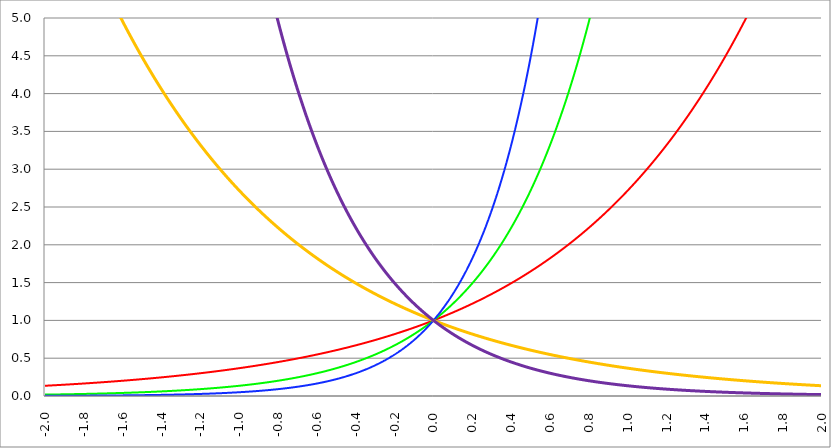
| Category | Series 1 | Series 0 | Series 2 | Series 3 | Series 4 |
|---|---|---|---|---|---|
| -2.0 | 0.135 | 0.018 | 0.002 | 7.389 | 54.598 |
| -1.998 | 0.136 | 0.018 | 0.002 | 7.374 | 54.38 |
| -1.996 | 0.136 | 0.018 | 0.003 | 7.36 | 54.163 |
| -1.994 | 0.136 | 0.019 | 0.003 | 7.345 | 53.947 |
| -1.992 | 0.136 | 0.019 | 0.003 | 7.33 | 53.732 |
| -1.99 | 0.137 | 0.019 | 0.003 | 7.316 | 53.517 |
| -1.988 | 0.137 | 0.019 | 0.003 | 7.301 | 53.303 |
| -1.986 | 0.137 | 0.019 | 0.003 | 7.286 | 53.091 |
| -1.984 | 0.138 | 0.019 | 0.003 | 7.272 | 52.879 |
| -1.982 | 0.138 | 0.019 | 0.003 | 7.257 | 52.668 |
| -1.98 | 0.138 | 0.019 | 0.003 | 7.243 | 52.457 |
| -1.978 | 0.138 | 0.019 | 0.003 | 7.228 | 52.248 |
| -1.976 | 0.139 | 0.019 | 0.003 | 7.214 | 52.039 |
| -1.974 | 0.139 | 0.019 | 0.003 | 7.199 | 51.832 |
| -1.972 | 0.139 | 0.019 | 0.003 | 7.185 | 51.625 |
| -1.97 | 0.139 | 0.019 | 0.003 | 7.171 | 51.419 |
| -1.968 | 0.14 | 0.02 | 0.003 | 7.156 | 51.213 |
| -1.966 | 0.14 | 0.02 | 0.003 | 7.142 | 51.009 |
| -1.964 | 0.14 | 0.02 | 0.003 | 7.128 | 50.805 |
| -1.962 | 0.141 | 0.02 | 0.003 | 7.114 | 50.602 |
| -1.96 | 0.141 | 0.02 | 0.003 | 7.099 | 50.4 |
| -1.958 | 0.141 | 0.02 | 0.003 | 7.085 | 50.199 |
| -1.956 | 0.141 | 0.02 | 0.003 | 7.071 | 49.999 |
| -1.954 | 0.142 | 0.02 | 0.003 | 7.057 | 49.799 |
| -1.952 | 0.142 | 0.02 | 0.003 | 7.043 | 49.6 |
| -1.95 | 0.142 | 0.02 | 0.003 | 7.029 | 49.402 |
| -1.948 | 0.143 | 0.02 | 0.003 | 7.015 | 49.205 |
| -1.946 | 0.143 | 0.02 | 0.003 | 7.001 | 49.009 |
| -1.944 | 0.143 | 0.02 | 0.003 | 6.987 | 48.813 |
| -1.942 | 0.143 | 0.021 | 0.003 | 6.973 | 48.618 |
| -1.94 | 0.144 | 0.021 | 0.003 | 6.959 | 48.424 |
| -1.938 | 0.144 | 0.021 | 0.003 | 6.945 | 48.231 |
| -1.936 | 0.144 | 0.021 | 0.003 | 6.931 | 48.038 |
| -1.934 | 0.145 | 0.021 | 0.003 | 6.917 | 47.847 |
| -1.932 | 0.145 | 0.021 | 0.003 | 6.903 | 47.656 |
| -1.93 | 0.145 | 0.021 | 0.003 | 6.89 | 47.465 |
| -1.928 | 0.145 | 0.021 | 0.003 | 6.876 | 47.276 |
| -1.926 | 0.146 | 0.021 | 0.003 | 6.862 | 47.087 |
| -1.924 | 0.146 | 0.021 | 0.003 | 6.848 | 46.899 |
| -1.922 | 0.146 | 0.021 | 0.003 | 6.835 | 46.712 |
| -1.92 | 0.147 | 0.021 | 0.003 | 6.821 | 46.525 |
| -1.918 | 0.147 | 0.022 | 0.003 | 6.807 | 46.34 |
| -1.916 | 0.147 | 0.022 | 0.003 | 6.794 | 46.155 |
| -1.914 | 0.147 | 0.022 | 0.003 | 6.78 | 45.971 |
| -1.912 | 0.148 | 0.022 | 0.003 | 6.767 | 45.787 |
| -1.91 | 0.148 | 0.022 | 0.003 | 6.753 | 45.604 |
| -1.908 | 0.148 | 0.022 | 0.003 | 6.74 | 45.422 |
| -1.906 | 0.149 | 0.022 | 0.003 | 6.726 | 45.241 |
| -1.904 | 0.149 | 0.022 | 0.003 | 6.713 | 45.06 |
| -1.902 | 0.149 | 0.022 | 0.003 | 6.699 | 44.88 |
| -1.9 | 0.15 | 0.022 | 0.003 | 6.686 | 44.701 |
| -1.898 | 0.15 | 0.022 | 0.003 | 6.673 | 44.523 |
| -1.896 | 0.15 | 0.023 | 0.003 | 6.659 | 44.345 |
| -1.894 | 0.15 | 0.023 | 0.003 | 6.646 | 44.168 |
| -1.892 | 0.151 | 0.023 | 0.003 | 6.633 | 43.992 |
| -1.89 | 0.151 | 0.023 | 0.003 | 6.619 | 43.816 |
| -1.888 | 0.151 | 0.023 | 0.003 | 6.606 | 43.641 |
| -1.886 | 0.152 | 0.023 | 0.003 | 6.593 | 43.467 |
| -1.884 | 0.152 | 0.023 | 0.004 | 6.58 | 43.293 |
| -1.882 | 0.152 | 0.023 | 0.004 | 6.567 | 43.121 |
| -1.88 | 0.153 | 0.023 | 0.004 | 6.554 | 42.948 |
| -1.878 | 0.153 | 0.023 | 0.004 | 6.54 | 42.777 |
| -1.876 | 0.153 | 0.023 | 0.004 | 6.527 | 42.606 |
| -1.874 | 0.154 | 0.024 | 0.004 | 6.514 | 42.436 |
| -1.872 | 0.154 | 0.024 | 0.004 | 6.501 | 42.267 |
| -1.87 | 0.154 | 0.024 | 0.004 | 6.488 | 42.098 |
| -1.868 | 0.154 | 0.024 | 0.004 | 6.475 | 41.93 |
| -1.866 | 0.155 | 0.024 | 0.004 | 6.462 | 41.763 |
| -1.864 | 0.155 | 0.024 | 0.004 | 6.449 | 41.596 |
| -1.862 | 0.155 | 0.024 | 0.004 | 6.437 | 41.43 |
| -1.86 | 0.156 | 0.024 | 0.004 | 6.424 | 41.264 |
| -1.858 | 0.156 | 0.024 | 0.004 | 6.411 | 41.1 |
| -1.856 | 0.156 | 0.024 | 0.004 | 6.398 | 40.936 |
| -1.854 | 0.157 | 0.025 | 0.004 | 6.385 | 40.772 |
| -1.852 | 0.157 | 0.025 | 0.004 | 6.373 | 40.609 |
| -1.85 | 0.157 | 0.025 | 0.004 | 6.36 | 40.447 |
| -1.848 | 0.158 | 0.025 | 0.004 | 6.347 | 40.286 |
| -1.846 | 0.158 | 0.025 | 0.004 | 6.334 | 40.125 |
| -1.844 | 0.158 | 0.025 | 0.004 | 6.322 | 39.965 |
| -1.842 | 0.159 | 0.025 | 0.004 | 6.309 | 39.805 |
| -1.84 | 0.159 | 0.025 | 0.004 | 6.297 | 39.646 |
| -1.838 | 0.159 | 0.025 | 0.004 | 6.284 | 39.488 |
| -1.836 | 0.159 | 0.025 | 0.004 | 6.271 | 39.33 |
| -1.834 | 0.16 | 0.026 | 0.004 | 6.259 | 39.173 |
| -1.832 | 0.16 | 0.026 | 0.004 | 6.246 | 39.017 |
| -1.83 | 0.16 | 0.026 | 0.004 | 6.234 | 38.861 |
| -1.828 | 0.161 | 0.026 | 0.004 | 6.221 | 38.706 |
| -1.826 | 0.161 | 0.026 | 0.004 | 6.209 | 38.552 |
| -1.824 | 0.161 | 0.026 | 0.004 | 6.197 | 38.398 |
| -1.822 | 0.162 | 0.026 | 0.004 | 6.184 | 38.245 |
| -1.82 | 0.162 | 0.026 | 0.004 | 6.172 | 38.092 |
| -1.818 | 0.162 | 0.026 | 0.004 | 6.16 | 37.94 |
| -1.816 | 0.163 | 0.026 | 0.004 | 6.147 | 37.788 |
| -1.814 | 0.163 | 0.027 | 0.004 | 6.135 | 37.637 |
| -1.812 | 0.163 | 0.027 | 0.004 | 6.123 | 37.487 |
| -1.81 | 0.164 | 0.027 | 0.004 | 6.11 | 37.338 |
| -1.808 | 0.164 | 0.027 | 0.004 | 6.098 | 37.189 |
| -1.806 | 0.164 | 0.027 | 0.004 | 6.086 | 37.04 |
| -1.804 | 0.165 | 0.027 | 0.004 | 6.074 | 36.892 |
| -1.802 | 0.165 | 0.027 | 0.004 | 6.062 | 36.745 |
| -1.8 | 0.165 | 0.027 | 0.005 | 6.05 | 36.598 |
| -1.798 | 0.166 | 0.027 | 0.005 | 6.038 | 36.452 |
| -1.796 | 0.166 | 0.028 | 0.005 | 6.025 | 36.307 |
| -1.794 | 0.166 | 0.028 | 0.005 | 6.013 | 36.162 |
| -1.792 | 0.167 | 0.028 | 0.005 | 6.001 | 36.017 |
| -1.79 | 0.167 | 0.028 | 0.005 | 5.989 | 35.874 |
| -1.788 | 0.167 | 0.028 | 0.005 | 5.977 | 35.73 |
| -1.786 | 0.168 | 0.028 | 0.005 | 5.966 | 35.588 |
| -1.784 | 0.168 | 0.028 | 0.005 | 5.954 | 35.446 |
| -1.782 | 0.168 | 0.028 | 0.005 | 5.942 | 35.304 |
| -1.78 | 0.169 | 0.028 | 0.005 | 5.93 | 35.163 |
| -1.778 | 0.169 | 0.029 | 0.005 | 5.918 | 35.023 |
| -1.776 | 0.169 | 0.029 | 0.005 | 5.906 | 34.883 |
| -1.774 | 0.17 | 0.029 | 0.005 | 5.894 | 34.744 |
| -1.772 | 0.17 | 0.029 | 0.005 | 5.883 | 34.605 |
| -1.77 | 0.17 | 0.029 | 0.005 | 5.871 | 34.467 |
| -1.768 | 0.171 | 0.029 | 0.005 | 5.859 | 34.329 |
| -1.766 | 0.171 | 0.029 | 0.005 | 5.847 | 34.192 |
| -1.764 | 0.171 | 0.029 | 0.005 | 5.836 | 34.056 |
| -1.762 | 0.172 | 0.029 | 0.005 | 5.824 | 33.92 |
| -1.76 | 0.172 | 0.03 | 0.005 | 5.812 | 33.784 |
| -1.758 | 0.172 | 0.03 | 0.005 | 5.801 | 33.65 |
| -1.756 | 0.173 | 0.03 | 0.005 | 5.789 | 33.515 |
| -1.754 | 0.173 | 0.03 | 0.005 | 5.778 | 33.381 |
| -1.752 | 0.173 | 0.03 | 0.005 | 5.766 | 33.248 |
| -1.75 | 0.174 | 0.03 | 0.005 | 5.755 | 33.115 |
| -1.748 | 0.174 | 0.03 | 0.005 | 5.743 | 32.983 |
| -1.746 | 0.174 | 0.03 | 0.005 | 5.732 | 32.852 |
| -1.744 | 0.175 | 0.031 | 0.005 | 5.72 | 32.72 |
| -1.742 | 0.175 | 0.031 | 0.005 | 5.709 | 32.59 |
| -1.74 | 0.176 | 0.031 | 0.005 | 5.697 | 32.46 |
| -1.738 | 0.176 | 0.031 | 0.005 | 5.686 | 32.33 |
| -1.736 | 0.176 | 0.031 | 0.005 | 5.675 | 32.201 |
| -1.734 | 0.177 | 0.031 | 0.006 | 5.663 | 32.073 |
| -1.732 | 0.177 | 0.031 | 0.006 | 5.652 | 31.944 |
| -1.73 | 0.177 | 0.031 | 0.006 | 5.641 | 31.817 |
| -1.728 | 0.178 | 0.032 | 0.006 | 5.629 | 31.69 |
| -1.726 | 0.178 | 0.032 | 0.006 | 5.618 | 31.563 |
| -1.724 | 0.178 | 0.032 | 0.006 | 5.607 | 31.437 |
| -1.722 | 0.179 | 0.032 | 0.006 | 5.596 | 31.312 |
| -1.72 | 0.179 | 0.032 | 0.006 | 5.585 | 31.187 |
| -1.718 | 0.179 | 0.032 | 0.006 | 5.573 | 31.062 |
| -1.716 | 0.18 | 0.032 | 0.006 | 5.562 | 30.938 |
| -1.714 | 0.18 | 0.032 | 0.006 | 5.551 | 30.815 |
| -1.712 | 0.181 | 0.033 | 0.006 | 5.54 | 30.692 |
| -1.71 | 0.181 | 0.033 | 0.006 | 5.529 | 30.569 |
| -1.708 | 0.181 | 0.033 | 0.006 | 5.518 | 30.447 |
| -1.706 | 0.182 | 0.033 | 0.006 | 5.507 | 30.326 |
| -1.704 | 0.182 | 0.033 | 0.006 | 5.496 | 30.205 |
| -1.702 | 0.182 | 0.033 | 0.006 | 5.485 | 30.084 |
| -1.7 | 0.183 | 0.033 | 0.006 | 5.474 | 29.964 |
| -1.698 | 0.183 | 0.034 | 0.006 | 5.463 | 29.844 |
| -1.696 | 0.183 | 0.034 | 0.006 | 5.452 | 29.725 |
| -1.694 | 0.184 | 0.034 | 0.006 | 5.441 | 29.607 |
| -1.692 | 0.184 | 0.034 | 0.006 | 5.43 | 29.488 |
| -1.69 | 0.185 | 0.034 | 0.006 | 5.419 | 29.371 |
| -1.688 | 0.185 | 0.034 | 0.006 | 5.409 | 29.254 |
| -1.686 | 0.185 | 0.034 | 0.006 | 5.398 | 29.137 |
| -1.684 | 0.186 | 0.034 | 0.006 | 5.387 | 29.02 |
| -1.682 | 0.186 | 0.035 | 0.006 | 5.376 | 28.905 |
| -1.68 | 0.186 | 0.035 | 0.006 | 5.366 | 28.789 |
| -1.678 | 0.187 | 0.035 | 0.007 | 5.355 | 28.674 |
| -1.676 | 0.187 | 0.035 | 0.007 | 5.344 | 28.56 |
| -1.674 | 0.187 | 0.035 | 0.007 | 5.333 | 28.446 |
| -1.672 | 0.188 | 0.035 | 0.007 | 5.323 | 28.332 |
| -1.67 | 0.188 | 0.035 | 0.007 | 5.312 | 28.219 |
| -1.668 | 0.189 | 0.036 | 0.007 | 5.302 | 28.106 |
| -1.666 | 0.189 | 0.036 | 0.007 | 5.291 | 27.994 |
| -1.664 | 0.189 | 0.036 | 0.007 | 5.28 | 27.883 |
| -1.662 | 0.19 | 0.036 | 0.007 | 5.27 | 27.771 |
| -1.66 | 0.19 | 0.036 | 0.007 | 5.259 | 27.66 |
| -1.658 | 0.191 | 0.036 | 0.007 | 5.249 | 27.55 |
| -1.656 | 0.191 | 0.036 | 0.007 | 5.238 | 27.44 |
| -1.654 | 0.191 | 0.037 | 0.007 | 5.228 | 27.33 |
| -1.652 | 0.192 | 0.037 | 0.007 | 5.217 | 27.221 |
| -1.65 | 0.192 | 0.037 | 0.007 | 5.207 | 27.113 |
| -1.648 | 0.192 | 0.037 | 0.007 | 5.197 | 27.004 |
| -1.646 | 0.193 | 0.037 | 0.007 | 5.186 | 26.897 |
| -1.644 | 0.193 | 0.037 | 0.007 | 5.176 | 26.789 |
| -1.642 | 0.194 | 0.037 | 0.007 | 5.165 | 26.682 |
| -1.64 | 0.194 | 0.038 | 0.007 | 5.155 | 26.576 |
| -1.638 | 0.194 | 0.038 | 0.007 | 5.145 | 26.47 |
| -1.636 | 0.195 | 0.038 | 0.007 | 5.135 | 26.364 |
| -1.634 | 0.195 | 0.038 | 0.007 | 5.124 | 26.259 |
| -1.632 | 0.196 | 0.038 | 0.007 | 5.114 | 26.154 |
| -1.63 | 0.196 | 0.038 | 0.008 | 5.104 | 26.05 |
| -1.628 | 0.196 | 0.039 | 0.008 | 5.094 | 25.946 |
| -1.626 | 0.197 | 0.039 | 0.008 | 5.083 | 25.842 |
| -1.624 | 0.197 | 0.039 | 0.008 | 5.073 | 25.739 |
| -1.622 | 0.198 | 0.039 | 0.008 | 5.063 | 25.636 |
| -1.62 | 0.198 | 0.039 | 0.008 | 5.053 | 25.534 |
| -1.618 | 0.198 | 0.039 | 0.008 | 5.043 | 25.432 |
| -1.616 | 0.199 | 0.039 | 0.008 | 5.033 | 25.33 |
| -1.614 | 0.199 | 0.04 | 0.008 | 5.023 | 25.229 |
| -1.612 | 0.199 | 0.04 | 0.008 | 5.013 | 25.128 |
| -1.61 | 0.2 | 0.04 | 0.008 | 5.003 | 25.028 |
| -1.608 | 0.2 | 0.04 | 0.008 | 4.993 | 24.928 |
| -1.606 | 0.201 | 0.04 | 0.008 | 4.983 | 24.829 |
| -1.604 | 0.201 | 0.04 | 0.008 | 4.973 | 24.73 |
| -1.602 | 0.201 | 0.041 | 0.008 | 4.963 | 24.631 |
| -1.6 | 0.202 | 0.041 | 0.008 | 4.953 | 24.533 |
| -1.598 | 0.202 | 0.041 | 0.008 | 4.943 | 24.435 |
| -1.596 | 0.203 | 0.041 | 0.008 | 4.933 | 24.337 |
| -1.594 | 0.203 | 0.041 | 0.008 | 4.923 | 24.24 |
| -1.592 | 0.204 | 0.041 | 0.008 | 4.914 | 24.143 |
| -1.59 | 0.204 | 0.042 | 0.008 | 4.904 | 24.047 |
| -1.588 | 0.204 | 0.042 | 0.009 | 4.894 | 23.951 |
| -1.586 | 0.205 | 0.042 | 0.009 | 4.884 | 23.855 |
| -1.584 | 0.205 | 0.042 | 0.009 | 4.874 | 23.76 |
| -1.582 | 0.206 | 0.042 | 0.009 | 4.865 | 23.665 |
| -1.58 | 0.206 | 0.042 | 0.009 | 4.855 | 23.571 |
| -1.578 | 0.206 | 0.043 | 0.009 | 4.845 | 23.477 |
| -1.576 | 0.207 | 0.043 | 0.009 | 4.836 | 23.383 |
| -1.574 | 0.207 | 0.043 | 0.009 | 4.826 | 23.289 |
| -1.572 | 0.208 | 0.043 | 0.009 | 4.816 | 23.196 |
| -1.57 | 0.208 | 0.043 | 0.009 | 4.807 | 23.104 |
| -1.568 | 0.208 | 0.043 | 0.009 | 4.797 | 23.012 |
| -1.566 | 0.209 | 0.044 | 0.009 | 4.787 | 22.92 |
| -1.564 | 0.209 | 0.044 | 0.009 | 4.778 | 22.828 |
| -1.562 | 0.21 | 0.044 | 0.009 | 4.768 | 22.737 |
| -1.56 | 0.21 | 0.044 | 0.009 | 4.759 | 22.646 |
| -1.558 | 0.211 | 0.044 | 0.009 | 4.749 | 22.556 |
| -1.556 | 0.211 | 0.045 | 0.009 | 4.74 | 22.466 |
| -1.554 | 0.211 | 0.045 | 0.009 | 4.73 | 22.376 |
| -1.552 | 0.212 | 0.045 | 0.01 | 4.721 | 22.287 |
| -1.55 | 0.212 | 0.045 | 0.01 | 4.711 | 22.198 |
| -1.548 | 0.213 | 0.045 | 0.01 | 4.702 | 22.109 |
| -1.546 | 0.213 | 0.045 | 0.01 | 4.693 | 22.021 |
| -1.544 | 0.214 | 0.046 | 0.01 | 4.683 | 21.933 |
| -1.542 | 0.214 | 0.046 | 0.01 | 4.674 | 21.846 |
| -1.54 | 0.214 | 0.046 | 0.01 | 4.665 | 21.758 |
| -1.538 | 0.215 | 0.046 | 0.01 | 4.655 | 21.672 |
| -1.536 | 0.215 | 0.046 | 0.01 | 4.646 | 21.585 |
| -1.534 | 0.216 | 0.047 | 0.01 | 4.637 | 21.499 |
| -1.532 | 0.216 | 0.047 | 0.01 | 4.627 | 21.413 |
| -1.53 | 0.217 | 0.047 | 0.01 | 4.618 | 21.328 |
| -1.528 | 0.217 | 0.047 | 0.01 | 4.609 | 21.242 |
| -1.526 | 0.217 | 0.047 | 0.01 | 4.6 | 21.158 |
| -1.524 | 0.218 | 0.047 | 0.01 | 4.591 | 21.073 |
| -1.522 | 0.218 | 0.048 | 0.01 | 4.581 | 20.989 |
| -1.52 | 0.219 | 0.048 | 0.01 | 4.572 | 20.905 |
| -1.518 | 0.219 | 0.048 | 0.011 | 4.563 | 20.822 |
| -1.516 | 0.22 | 0.048 | 0.011 | 4.554 | 20.739 |
| -1.514 | 0.22 | 0.048 | 0.011 | 4.545 | 20.656 |
| -1.512 | 0.22 | 0.049 | 0.011 | 4.536 | 20.573 |
| -1.51 | 0.221 | 0.049 | 0.011 | 4.527 | 20.491 |
| -1.508 | 0.221 | 0.049 | 0.011 | 4.518 | 20.409 |
| -1.506 | 0.222 | 0.049 | 0.011 | 4.509 | 20.328 |
| -1.504 | 0.222 | 0.049 | 0.011 | 4.5 | 20.247 |
| -1.502 | 0.223 | 0.05 | 0.011 | 4.491 | 20.166 |
| -1.5 | 0.223 | 0.05 | 0.011 | 4.482 | 20.086 |
| -1.498 | 0.224 | 0.05 | 0.011 | 4.473 | 20.005 |
| -1.496 | 0.224 | 0.05 | 0.011 | 4.464 | 19.925 |
| -1.494 | 0.224 | 0.05 | 0.011 | 4.455 | 19.846 |
| -1.492 | 0.225 | 0.051 | 0.011 | 4.446 | 19.767 |
| -1.49 | 0.225 | 0.051 | 0.011 | 4.437 | 19.688 |
| -1.488 | 0.226 | 0.051 | 0.012 | 4.428 | 19.609 |
| -1.486 | 0.226 | 0.051 | 0.012 | 4.419 | 19.531 |
| -1.484 | 0.227 | 0.051 | 0.012 | 4.411 | 19.453 |
| -1.482 | 0.227 | 0.052 | 0.012 | 4.402 | 19.375 |
| -1.48 | 0.228 | 0.052 | 0.012 | 4.393 | 19.298 |
| -1.478 | 0.228 | 0.052 | 0.012 | 4.384 | 19.221 |
| -1.476 | 0.229 | 0.052 | 0.012 | 4.375 | 19.144 |
| -1.474 | 0.229 | 0.052 | 0.012 | 4.367 | 19.068 |
| -1.472 | 0.229 | 0.053 | 0.012 | 4.358 | 18.992 |
| -1.469999999999999 | 0.23 | 0.053 | 0.012 | 4.349 | 18.916 |
| -1.467999999999999 | 0.23 | 0.053 | 0.012 | 4.341 | 18.84 |
| -1.465999999999999 | 0.231 | 0.053 | 0.012 | 4.332 | 18.765 |
| -1.463999999999999 | 0.231 | 0.054 | 0.012 | 4.323 | 18.69 |
| -1.461999999999999 | 0.232 | 0.054 | 0.012 | 4.315 | 18.616 |
| -1.459999999999999 | 0.232 | 0.054 | 0.013 | 4.306 | 18.541 |
| -1.457999999999999 | 0.233 | 0.054 | 0.013 | 4.297 | 18.467 |
| -1.455999999999999 | 0.233 | 0.054 | 0.013 | 4.289 | 18.394 |
| -1.453999999999999 | 0.234 | 0.055 | 0.013 | 4.28 | 18.32 |
| -1.451999999999999 | 0.234 | 0.055 | 0.013 | 4.272 | 18.247 |
| -1.449999999999999 | 0.235 | 0.055 | 0.013 | 4.263 | 18.174 |
| -1.447999999999999 | 0.235 | 0.055 | 0.013 | 4.255 | 18.102 |
| -1.445999999999999 | 0.236 | 0.055 | 0.013 | 4.246 | 18.029 |
| -1.443999999999999 | 0.236 | 0.056 | 0.013 | 4.238 | 17.957 |
| -1.441999999999999 | 0.236 | 0.056 | 0.013 | 4.229 | 17.886 |
| -1.439999999999999 | 0.237 | 0.056 | 0.013 | 4.221 | 17.814 |
| -1.437999999999999 | 0.237 | 0.056 | 0.013 | 4.212 | 17.743 |
| -1.435999999999999 | 0.238 | 0.057 | 0.013 | 4.204 | 17.672 |
| -1.433999999999999 | 0.238 | 0.057 | 0.014 | 4.195 | 17.602 |
| -1.431999999999999 | 0.239 | 0.057 | 0.014 | 4.187 | 17.532 |
| -1.429999999999999 | 0.239 | 0.057 | 0.014 | 4.179 | 17.462 |
| -1.427999999999999 | 0.24 | 0.057 | 0.014 | 4.17 | 17.392 |
| -1.425999999999999 | 0.24 | 0.058 | 0.014 | 4.162 | 17.322 |
| -1.423999999999999 | 0.241 | 0.058 | 0.014 | 4.154 | 17.253 |
| -1.421999999999999 | 0.241 | 0.058 | 0.014 | 4.145 | 17.184 |
| -1.419999999999999 | 0.242 | 0.058 | 0.014 | 4.137 | 17.116 |
| -1.417999999999999 | 0.242 | 0.059 | 0.014 | 4.129 | 17.047 |
| -1.415999999999999 | 0.243 | 0.059 | 0.014 | 4.121 | 16.979 |
| -1.413999999999999 | 0.243 | 0.059 | 0.014 | 4.112 | 16.912 |
| -1.411999999999999 | 0.244 | 0.059 | 0.014 | 4.104 | 16.844 |
| -1.409999999999999 | 0.244 | 0.06 | 0.015 | 4.096 | 16.777 |
| -1.407999999999999 | 0.245 | 0.06 | 0.015 | 4.088 | 16.71 |
| -1.405999999999999 | 0.245 | 0.06 | 0.015 | 4.08 | 16.643 |
| -1.403999999999999 | 0.246 | 0.06 | 0.015 | 4.071 | 16.577 |
| -1.401999999999999 | 0.246 | 0.061 | 0.015 | 4.063 | 16.511 |
| -1.399999999999999 | 0.247 | 0.061 | 0.015 | 4.055 | 16.445 |
| -1.397999999999999 | 0.247 | 0.061 | 0.015 | 4.047 | 16.379 |
| -1.395999999999999 | 0.248 | 0.061 | 0.015 | 4.039 | 16.314 |
| -1.393999999999999 | 0.248 | 0.062 | 0.015 | 4.031 | 16.248 |
| -1.391999999999999 | 0.249 | 0.062 | 0.015 | 4.023 | 16.184 |
| -1.389999999999999 | 0.249 | 0.062 | 0.015 | 4.015 | 16.119 |
| -1.387999999999999 | 0.25 | 0.062 | 0.016 | 4.007 | 16.055 |
| -1.385999999999999 | 0.25 | 0.063 | 0.016 | 3.999 | 15.991 |
| -1.383999999999999 | 0.251 | 0.063 | 0.016 | 3.991 | 15.927 |
| -1.381999999999999 | 0.251 | 0.063 | 0.016 | 3.983 | 15.863 |
| -1.379999999999999 | 0.252 | 0.063 | 0.016 | 3.975 | 15.8 |
| -1.377999999999999 | 0.252 | 0.064 | 0.016 | 3.967 | 15.737 |
| -1.375999999999999 | 0.253 | 0.064 | 0.016 | 3.959 | 15.674 |
| -1.373999999999999 | 0.253 | 0.064 | 0.016 | 3.951 | 15.611 |
| -1.371999999999999 | 0.254 | 0.064 | 0.016 | 3.943 | 15.549 |
| -1.369999999999999 | 0.254 | 0.065 | 0.016 | 3.935 | 15.487 |
| -1.367999999999999 | 0.255 | 0.065 | 0.017 | 3.927 | 15.425 |
| -1.365999999999999 | 0.255 | 0.065 | 0.017 | 3.92 | 15.364 |
| -1.363999999999999 | 0.256 | 0.065 | 0.017 | 3.912 | 15.302 |
| -1.361999999999999 | 0.256 | 0.066 | 0.017 | 3.904 | 15.241 |
| -1.359999999999999 | 0.257 | 0.066 | 0.017 | 3.896 | 15.18 |
| -1.357999999999999 | 0.257 | 0.066 | 0.017 | 3.888 | 15.12 |
| -1.355999999999999 | 0.258 | 0.066 | 0.017 | 3.881 | 15.059 |
| -1.353999999999999 | 0.258 | 0.067 | 0.017 | 3.873 | 14.999 |
| -1.351999999999999 | 0.259 | 0.067 | 0.017 | 3.865 | 14.939 |
| -1.349999999999999 | 0.259 | 0.067 | 0.017 | 3.857 | 14.88 |
| -1.347999999999999 | 0.26 | 0.067 | 0.018 | 3.85 | 14.82 |
| -1.345999999999999 | 0.26 | 0.068 | 0.018 | 3.842 | 14.761 |
| -1.343999999999999 | 0.261 | 0.068 | 0.018 | 3.834 | 14.702 |
| -1.341999999999999 | 0.261 | 0.068 | 0.018 | 3.827 | 14.644 |
| -1.339999999999999 | 0.262 | 0.069 | 0.018 | 3.819 | 14.585 |
| -1.337999999999999 | 0.262 | 0.069 | 0.018 | 3.811 | 14.527 |
| -1.335999999999999 | 0.263 | 0.069 | 0.018 | 3.804 | 14.469 |
| -1.333999999999999 | 0.263 | 0.069 | 0.018 | 3.796 | 14.411 |
| -1.331999999999999 | 0.264 | 0.07 | 0.018 | 3.789 | 14.354 |
| -1.329999999999999 | 0.264 | 0.07 | 0.018 | 3.781 | 14.296 |
| -1.327999999999999 | 0.265 | 0.07 | 0.019 | 3.773 | 14.239 |
| -1.325999999999999 | 0.266 | 0.071 | 0.019 | 3.766 | 14.182 |
| -1.323999999999999 | 0.266 | 0.071 | 0.019 | 3.758 | 14.126 |
| -1.321999999999999 | 0.267 | 0.071 | 0.019 | 3.751 | 14.069 |
| -1.319999999999999 | 0.267 | 0.071 | 0.019 | 3.743 | 14.013 |
| -1.317999999999999 | 0.268 | 0.072 | 0.019 | 3.736 | 13.957 |
| -1.315999999999999 | 0.268 | 0.072 | 0.019 | 3.728 | 13.902 |
| -1.313999999999999 | 0.269 | 0.072 | 0.019 | 3.721 | 13.846 |
| -1.311999999999999 | 0.269 | 0.073 | 0.02 | 3.714 | 13.791 |
| -1.309999999999999 | 0.27 | 0.073 | 0.02 | 3.706 | 13.736 |
| -1.307999999999999 | 0.27 | 0.073 | 0.02 | 3.699 | 13.681 |
| -1.305999999999999 | 0.271 | 0.073 | 0.02 | 3.691 | 13.626 |
| -1.303999999999999 | 0.271 | 0.074 | 0.02 | 3.684 | 13.572 |
| -1.301999999999999 | 0.272 | 0.074 | 0.02 | 3.677 | 13.518 |
| -1.299999999999999 | 0.273 | 0.074 | 0.02 | 3.669 | 13.464 |
| -1.297999999999999 | 0.273 | 0.075 | 0.02 | 3.662 | 13.41 |
| -1.295999999999999 | 0.274 | 0.075 | 0.02 | 3.655 | 13.356 |
| -1.293999999999999 | 0.274 | 0.075 | 0.021 | 3.647 | 13.303 |
| -1.291999999999999 | 0.275 | 0.075 | 0.021 | 3.64 | 13.25 |
| -1.289999999999999 | 0.275 | 0.076 | 0.021 | 3.633 | 13.197 |
| -1.287999999999999 | 0.276 | 0.076 | 0.021 | 3.626 | 13.144 |
| -1.285999999999999 | 0.276 | 0.076 | 0.021 | 3.618 | 13.092 |
| -1.283999999999999 | 0.277 | 0.077 | 0.021 | 3.611 | 13.04 |
| -1.281999999999999 | 0.277 | 0.077 | 0.021 | 3.604 | 12.988 |
| -1.279999999999999 | 0.278 | 0.077 | 0.021 | 3.597 | 12.936 |
| -1.277999999999999 | 0.279 | 0.078 | 0.022 | 3.589 | 12.884 |
| -1.275999999999999 | 0.279 | 0.078 | 0.022 | 3.582 | 12.833 |
| -1.273999999999999 | 0.28 | 0.078 | 0.022 | 3.575 | 12.782 |
| -1.271999999999999 | 0.28 | 0.079 | 0.022 | 3.568 | 12.73 |
| -1.269999999999999 | 0.281 | 0.079 | 0.022 | 3.561 | 12.68 |
| -1.267999999999999 | 0.281 | 0.079 | 0.022 | 3.554 | 12.629 |
| -1.265999999999999 | 0.282 | 0.079 | 0.022 | 3.547 | 12.579 |
| -1.263999999999999 | 0.283 | 0.08 | 0.023 | 3.54 | 12.528 |
| -1.261999999999999 | 0.283 | 0.08 | 0.023 | 3.532 | 12.478 |
| -1.259999999999999 | 0.284 | 0.08 | 0.023 | 3.525 | 12.429 |
| -1.257999999999999 | 0.284 | 0.081 | 0.023 | 3.518 | 12.379 |
| -1.255999999999999 | 0.285 | 0.081 | 0.023 | 3.511 | 12.33 |
| -1.253999999999999 | 0.285 | 0.081 | 0.023 | 3.504 | 12.28 |
| -1.251999999999999 | 0.286 | 0.082 | 0.023 | 3.497 | 12.231 |
| -1.249999999999999 | 0.287 | 0.082 | 0.024 | 3.49 | 12.182 |
| -1.247999999999999 | 0.287 | 0.082 | 0.024 | 3.483 | 12.134 |
| -1.245999999999999 | 0.288 | 0.083 | 0.024 | 3.476 | 12.085 |
| -1.243999999999999 | 0.288 | 0.083 | 0.024 | 3.469 | 12.037 |
| -1.241999999999999 | 0.289 | 0.083 | 0.024 | 3.463 | 11.989 |
| -1.239999999999999 | 0.289 | 0.084 | 0.024 | 3.456 | 11.941 |
| -1.237999999999999 | 0.29 | 0.084 | 0.024 | 3.449 | 11.894 |
| -1.235999999999999 | 0.291 | 0.084 | 0.025 | 3.442 | 11.846 |
| -1.233999999999999 | 0.291 | 0.085 | 0.025 | 3.435 | 11.799 |
| -1.231999999999999 | 0.292 | 0.085 | 0.025 | 3.428 | 11.752 |
| -1.229999999999999 | 0.292 | 0.085 | 0.025 | 3.421 | 11.705 |
| -1.227999999999999 | 0.293 | 0.086 | 0.025 | 3.414 | 11.658 |
| -1.225999999999999 | 0.293 | 0.086 | 0.025 | 3.408 | 11.612 |
| -1.223999999999999 | 0.294 | 0.086 | 0.025 | 3.401 | 11.565 |
| -1.221999999999999 | 0.295 | 0.087 | 0.026 | 3.394 | 11.519 |
| -1.219999999999999 | 0.295 | 0.087 | 0.026 | 3.387 | 11.473 |
| -1.217999999999999 | 0.296 | 0.088 | 0.026 | 3.38 | 11.427 |
| -1.215999999999999 | 0.296 | 0.088 | 0.026 | 3.374 | 11.382 |
| -1.213999999999999 | 0.297 | 0.088 | 0.026 | 3.367 | 11.336 |
| -1.211999999999999 | 0.298 | 0.089 | 0.026 | 3.36 | 11.291 |
| -1.209999999999999 | 0.298 | 0.089 | 0.027 | 3.353 | 11.246 |
| -1.207999999999999 | 0.299 | 0.089 | 0.027 | 3.347 | 11.201 |
| -1.205999999999999 | 0.299 | 0.09 | 0.027 | 3.34 | 11.156 |
| -1.203999999999999 | 0.3 | 0.09 | 0.027 | 3.333 | 11.112 |
| -1.201999999999999 | 0.301 | 0.09 | 0.027 | 3.327 | 11.067 |
| -1.199999999999999 | 0.301 | 0.091 | 0.027 | 3.32 | 11.023 |
| -1.197999999999999 | 0.302 | 0.091 | 0.027 | 3.313 | 10.979 |
| -1.195999999999999 | 0.302 | 0.091 | 0.028 | 3.307 | 10.935 |
| -1.193999999999999 | 0.303 | 0.092 | 0.028 | 3.3 | 10.892 |
| -1.191999999999999 | 0.304 | 0.092 | 0.028 | 3.294 | 10.848 |
| -1.189999999999999 | 0.304 | 0.093 | 0.028 | 3.287 | 10.805 |
| -1.187999999999999 | 0.305 | 0.093 | 0.028 | 3.281 | 10.762 |
| -1.185999999999999 | 0.305 | 0.093 | 0.028 | 3.274 | 10.719 |
| -1.183999999999999 | 0.306 | 0.094 | 0.029 | 3.267 | 10.676 |
| -1.181999999999999 | 0.307 | 0.094 | 0.029 | 3.261 | 10.633 |
| -1.179999999999999 | 0.307 | 0.094 | 0.029 | 3.254 | 10.591 |
| -1.177999999999999 | 0.308 | 0.095 | 0.029 | 3.248 | 10.549 |
| -1.175999999999999 | 0.309 | 0.095 | 0.029 | 3.241 | 10.507 |
| -1.173999999999999 | 0.309 | 0.096 | 0.03 | 3.235 | 10.465 |
| -1.171999999999999 | 0.31 | 0.096 | 0.03 | 3.228 | 10.423 |
| -1.169999999999999 | 0.31 | 0.096 | 0.03 | 3.222 | 10.381 |
| -1.167999999999999 | 0.311 | 0.097 | 0.03 | 3.216 | 10.34 |
| -1.165999999999999 | 0.312 | 0.097 | 0.03 | 3.209 | 10.299 |
| -1.163999999999999 | 0.312 | 0.097 | 0.03 | 3.203 | 10.257 |
| -1.161999999999999 | 0.313 | 0.098 | 0.031 | 3.196 | 10.216 |
| -1.159999999999999 | 0.313 | 0.098 | 0.031 | 3.19 | 10.176 |
| -1.157999999999999 | 0.314 | 0.099 | 0.031 | 3.184 | 10.135 |
| -1.155999999999999 | 0.315 | 0.099 | 0.031 | 3.177 | 10.095 |
| -1.153999999999999 | 0.315 | 0.099 | 0.031 | 3.171 | 10.054 |
| -1.151999999999999 | 0.316 | 0.1 | 0.032 | 3.165 | 10.014 |
| -1.149999999999999 | 0.317 | 0.1 | 0.032 | 3.158 | 9.974 |
| -1.147999999999999 | 0.317 | 0.101 | 0.032 | 3.152 | 9.934 |
| -1.145999999999999 | 0.318 | 0.101 | 0.032 | 3.146 | 9.895 |
| -1.143999999999999 | 0.319 | 0.101 | 0.032 | 3.139 | 9.855 |
| -1.141999999999999 | 0.319 | 0.102 | 0.033 | 3.133 | 9.816 |
| -1.139999999999999 | 0.32 | 0.102 | 0.033 | 3.127 | 9.777 |
| -1.137999999999999 | 0.32 | 0.103 | 0.033 | 3.121 | 9.738 |
| -1.135999999999999 | 0.321 | 0.103 | 0.033 | 3.114 | 9.699 |
| -1.133999999999999 | 0.322 | 0.104 | 0.033 | 3.108 | 9.66 |
| -1.131999999999999 | 0.322 | 0.104 | 0.034 | 3.102 | 9.621 |
| -1.129999999999999 | 0.323 | 0.104 | 0.034 | 3.096 | 9.583 |
| -1.127999999999999 | 0.324 | 0.105 | 0.034 | 3.089 | 9.545 |
| -1.125999999999999 | 0.324 | 0.105 | 0.034 | 3.083 | 9.507 |
| -1.123999999999999 | 0.325 | 0.106 | 0.034 | 3.077 | 9.469 |
| -1.121999999999999 | 0.326 | 0.106 | 0.035 | 3.071 | 9.431 |
| -1.119999999999999 | 0.326 | 0.106 | 0.035 | 3.065 | 9.393 |
| -1.117999999999999 | 0.327 | 0.107 | 0.035 | 3.059 | 9.356 |
| -1.115999999999999 | 0.328 | 0.107 | 0.035 | 3.053 | 9.318 |
| -1.113999999999999 | 0.328 | 0.108 | 0.035 | 3.047 | 9.281 |
| -1.111999999999999 | 0.329 | 0.108 | 0.036 | 3.04 | 9.244 |
| -1.109999999999999 | 0.33 | 0.109 | 0.036 | 3.034 | 9.207 |
| -1.107999999999999 | 0.33 | 0.109 | 0.036 | 3.028 | 9.171 |
| -1.105999999999999 | 0.331 | 0.109 | 0.036 | 3.022 | 9.134 |
| -1.103999999999999 | 0.332 | 0.11 | 0.036 | 3.016 | 9.098 |
| -1.101999999999999 | 0.332 | 0.11 | 0.037 | 3.01 | 9.061 |
| -1.099999999999999 | 0.333 | 0.111 | 0.037 | 3.004 | 9.025 |
| -1.097999999999999 | 0.334 | 0.111 | 0.037 | 2.998 | 8.989 |
| -1.095999999999999 | 0.334 | 0.112 | 0.037 | 2.992 | 8.953 |
| -1.093999999999999 | 0.335 | 0.112 | 0.038 | 2.986 | 8.917 |
| -1.091999999999999 | 0.336 | 0.113 | 0.038 | 2.98 | 8.882 |
| -1.089999999999999 | 0.336 | 0.113 | 0.038 | 2.974 | 8.846 |
| -1.087999999999999 | 0.337 | 0.113 | 0.038 | 2.968 | 8.811 |
| -1.085999999999999 | 0.338 | 0.114 | 0.038 | 2.962 | 8.776 |
| -1.083999999999999 | 0.338 | 0.114 | 0.039 | 2.956 | 8.741 |
| -1.081999999999999 | 0.339 | 0.115 | 0.039 | 2.951 | 8.706 |
| -1.079999999999999 | 0.34 | 0.115 | 0.039 | 2.945 | 8.671 |
| -1.077999999999999 | 0.34 | 0.116 | 0.039 | 2.939 | 8.637 |
| -1.075999999999999 | 0.341 | 0.116 | 0.04 | 2.933 | 8.602 |
| -1.073999999999999 | 0.342 | 0.117 | 0.04 | 2.927 | 8.568 |
| -1.071999999999999 | 0.342 | 0.117 | 0.04 | 2.921 | 8.534 |
| -1.069999999999999 | 0.343 | 0.118 | 0.04 | 2.915 | 8.499 |
| -1.067999999999999 | 0.344 | 0.118 | 0.041 | 2.91 | 8.466 |
| -1.065999999999999 | 0.344 | 0.119 | 0.041 | 2.904 | 8.432 |
| -1.063999999999999 | 0.345 | 0.119 | 0.041 | 2.898 | 8.398 |
| -1.061999999999999 | 0.346 | 0.12 | 0.041 | 2.892 | 8.365 |
| -1.059999999999999 | 0.346 | 0.12 | 0.042 | 2.886 | 8.331 |
| -1.057999999999999 | 0.347 | 0.121 | 0.042 | 2.881 | 8.298 |
| -1.055999999999999 | 0.348 | 0.121 | 0.042 | 2.875 | 8.265 |
| -1.053999999999999 | 0.349 | 0.121 | 0.042 | 2.869 | 8.232 |
| -1.051999999999999 | 0.349 | 0.122 | 0.043 | 2.863 | 8.199 |
| -1.049999999999999 | 0.35 | 0.122 | 0.043 | 2.858 | 8.166 |
| -1.047999999999999 | 0.351 | 0.123 | 0.043 | 2.852 | 8.134 |
| -1.045999999999999 | 0.351 | 0.123 | 0.043 | 2.846 | 8.101 |
| -1.043999999999999 | 0.352 | 0.124 | 0.044 | 2.841 | 8.069 |
| -1.041999999999999 | 0.353 | 0.124 | 0.044 | 2.835 | 8.037 |
| -1.039999999999999 | 0.353 | 0.125 | 0.044 | 2.829 | 8.004 |
| -1.037999999999999 | 0.354 | 0.125 | 0.044 | 2.824 | 7.973 |
| -1.035999999999999 | 0.355 | 0.126 | 0.045 | 2.818 | 7.941 |
| -1.033999999999999 | 0.356 | 0.126 | 0.045 | 2.812 | 7.909 |
| -1.031999999999999 | 0.356 | 0.127 | 0.045 | 2.807 | 7.877 |
| -1.029999999999999 | 0.357 | 0.127 | 0.046 | 2.801 | 7.846 |
| -1.027999999999999 | 0.358 | 0.128 | 0.046 | 2.795 | 7.815 |
| -1.025999999999999 | 0.358 | 0.128 | 0.046 | 2.79 | 7.783 |
| -1.023999999999999 | 0.359 | 0.129 | 0.046 | 2.784 | 7.752 |
| -1.021999999999999 | 0.36 | 0.13 | 0.047 | 2.779 | 7.721 |
| -1.019999999999999 | 0.361 | 0.13 | 0.047 | 2.773 | 7.691 |
| -1.017999999999999 | 0.361 | 0.131 | 0.047 | 2.768 | 7.66 |
| -1.015999999999999 | 0.362 | 0.131 | 0.047 | 2.762 | 7.629 |
| -1.013999999999999 | 0.363 | 0.132 | 0.048 | 2.757 | 7.599 |
| -1.011999999999999 | 0.363 | 0.132 | 0.048 | 2.751 | 7.569 |
| -1.009999999999999 | 0.364 | 0.133 | 0.048 | 2.746 | 7.538 |
| -1.007999999999999 | 0.365 | 0.133 | 0.049 | 2.74 | 7.508 |
| -1.005999999999999 | 0.366 | 0.134 | 0.049 | 2.735 | 7.478 |
| -1.003999999999999 | 0.366 | 0.134 | 0.049 | 2.729 | 7.448 |
| -1.001999999999999 | 0.367 | 0.135 | 0.049 | 2.724 | 7.419 |
| -0.999999999999999 | 0.368 | 0.135 | 0.05 | 2.718 | 7.389 |
| -0.997999999999999 | 0.369 | 0.136 | 0.05 | 2.713 | 7.36 |
| -0.995999999999999 | 0.369 | 0.136 | 0.05 | 2.707 | 7.33 |
| -0.993999999999999 | 0.37 | 0.137 | 0.051 | 2.702 | 7.301 |
| -0.991999999999999 | 0.371 | 0.138 | 0.051 | 2.697 | 7.272 |
| -0.989999999999999 | 0.372 | 0.138 | 0.051 | 2.691 | 7.243 |
| -0.987999999999999 | 0.372 | 0.139 | 0.052 | 2.686 | 7.214 |
| -0.985999999999999 | 0.373 | 0.139 | 0.052 | 2.68 | 7.185 |
| -0.983999999999999 | 0.374 | 0.14 | 0.052 | 2.675 | 7.156 |
| -0.981999999999999 | 0.375 | 0.14 | 0.053 | 2.67 | 7.128 |
| -0.979999999999999 | 0.375 | 0.141 | 0.053 | 2.664 | 7.099 |
| -0.977999999999999 | 0.376 | 0.141 | 0.053 | 2.659 | 7.071 |
| -0.975999999999999 | 0.377 | 0.142 | 0.054 | 2.654 | 7.043 |
| -0.973999999999999 | 0.378 | 0.143 | 0.054 | 2.649 | 7.015 |
| -0.971999999999999 | 0.378 | 0.143 | 0.054 | 2.643 | 6.987 |
| -0.969999999999999 | 0.379 | 0.144 | 0.054 | 2.638 | 6.959 |
| -0.967999999999999 | 0.38 | 0.144 | 0.055 | 2.633 | 6.931 |
| -0.965999999999999 | 0.381 | 0.145 | 0.055 | 2.627 | 6.903 |
| -0.963999999999999 | 0.381 | 0.145 | 0.055 | 2.622 | 6.876 |
| -0.961999999999999 | 0.382 | 0.146 | 0.056 | 2.617 | 6.848 |
| -0.959999999999999 | 0.383 | 0.147 | 0.056 | 2.612 | 6.821 |
| -0.957999999999999 | 0.384 | 0.147 | 0.056 | 2.606 | 6.794 |
| -0.955999999999999 | 0.384 | 0.148 | 0.057 | 2.601 | 6.767 |
| -0.953999999999999 | 0.385 | 0.148 | 0.057 | 2.596 | 6.74 |
| -0.951999999999999 | 0.386 | 0.149 | 0.057 | 2.591 | 6.713 |
| -0.949999999999999 | 0.387 | 0.15 | 0.058 | 2.586 | 6.686 |
| -0.947999999999999 | 0.388 | 0.15 | 0.058 | 2.581 | 6.659 |
| -0.945999999999999 | 0.388 | 0.151 | 0.059 | 2.575 | 6.633 |
| -0.943999999999999 | 0.389 | 0.151 | 0.059 | 2.57 | 6.606 |
| -0.941999999999999 | 0.39 | 0.152 | 0.059 | 2.565 | 6.58 |
| -0.939999999999999 | 0.391 | 0.153 | 0.06 | 2.56 | 6.554 |
| -0.937999999999999 | 0.391 | 0.153 | 0.06 | 2.555 | 6.527 |
| -0.935999999999999 | 0.392 | 0.154 | 0.06 | 2.55 | 6.501 |
| -0.933999999999999 | 0.393 | 0.154 | 0.061 | 2.545 | 6.475 |
| -0.931999999999999 | 0.394 | 0.155 | 0.061 | 2.54 | 6.449 |
| -0.929999999999999 | 0.395 | 0.156 | 0.061 | 2.535 | 6.424 |
| -0.927999999999999 | 0.395 | 0.156 | 0.062 | 2.529 | 6.398 |
| -0.925999999999999 | 0.396 | 0.157 | 0.062 | 2.524 | 6.373 |
| -0.923999999999999 | 0.397 | 0.158 | 0.063 | 2.519 | 6.347 |
| -0.921999999999999 | 0.398 | 0.158 | 0.063 | 2.514 | 6.322 |
| -0.919999999999999 | 0.399 | 0.159 | 0.063 | 2.509 | 6.297 |
| -0.917999999999999 | 0.399 | 0.159 | 0.064 | 2.504 | 6.271 |
| -0.915999999999999 | 0.4 | 0.16 | 0.064 | 2.499 | 6.246 |
| -0.913999999999999 | 0.401 | 0.161 | 0.064 | 2.494 | 6.221 |
| -0.911999999999999 | 0.402 | 0.161 | 0.065 | 2.489 | 6.197 |
| -0.909999999999999 | 0.403 | 0.162 | 0.065 | 2.484 | 6.172 |
| -0.907999999999999 | 0.403 | 0.163 | 0.066 | 2.479 | 6.147 |
| -0.905999999999999 | 0.404 | 0.163 | 0.066 | 2.474 | 6.123 |
| -0.903999999999999 | 0.405 | 0.164 | 0.066 | 2.469 | 6.098 |
| -0.901999999999999 | 0.406 | 0.165 | 0.067 | 2.465 | 6.074 |
| -0.899999999999999 | 0.407 | 0.165 | 0.067 | 2.46 | 6.05 |
| -0.897999999999999 | 0.407 | 0.166 | 0.068 | 2.455 | 6.025 |
| -0.895999999999999 | 0.408 | 0.167 | 0.068 | 2.45 | 6.001 |
| -0.893999999999999 | 0.409 | 0.167 | 0.068 | 2.445 | 5.977 |
| -0.891999999999999 | 0.41 | 0.168 | 0.069 | 2.44 | 5.954 |
| -0.889999999999999 | 0.411 | 0.169 | 0.069 | 2.435 | 5.93 |
| -0.887999999999999 | 0.411 | 0.169 | 0.07 | 2.43 | 5.906 |
| -0.885999999999999 | 0.412 | 0.17 | 0.07 | 2.425 | 5.883 |
| -0.883999999999999 | 0.413 | 0.171 | 0.071 | 2.421 | 5.859 |
| -0.881999999999999 | 0.414 | 0.171 | 0.071 | 2.416 | 5.836 |
| -0.879999999999999 | 0.415 | 0.172 | 0.071 | 2.411 | 5.812 |
| -0.877999999999999 | 0.416 | 0.173 | 0.072 | 2.406 | 5.789 |
| -0.875999999999999 | 0.416 | 0.173 | 0.072 | 2.401 | 5.766 |
| -0.873999999999999 | 0.417 | 0.174 | 0.073 | 2.396 | 5.743 |
| -0.871999999999999 | 0.418 | 0.175 | 0.073 | 2.392 | 5.72 |
| -0.869999999999999 | 0.419 | 0.176 | 0.074 | 2.387 | 5.697 |
| -0.867999999999999 | 0.42 | 0.176 | 0.074 | 2.382 | 5.675 |
| -0.865999999999999 | 0.421 | 0.177 | 0.074 | 2.377 | 5.652 |
| -0.863999999999999 | 0.421 | 0.178 | 0.075 | 2.373 | 5.629 |
| -0.861999999999999 | 0.422 | 0.178 | 0.075 | 2.368 | 5.607 |
| -0.859999999999999 | 0.423 | 0.179 | 0.076 | 2.363 | 5.585 |
| -0.857999999999999 | 0.424 | 0.18 | 0.076 | 2.358 | 5.562 |
| -0.855999999999999 | 0.425 | 0.181 | 0.077 | 2.354 | 5.54 |
| -0.853999999999999 | 0.426 | 0.181 | 0.077 | 2.349 | 5.518 |
| -0.851999999999999 | 0.427 | 0.182 | 0.078 | 2.344 | 5.496 |
| -0.849999999999999 | 0.427 | 0.183 | 0.078 | 2.34 | 5.474 |
| -0.847999999999999 | 0.428 | 0.183 | 0.079 | 2.335 | 5.452 |
| -0.845999999999999 | 0.429 | 0.184 | 0.079 | 2.33 | 5.43 |
| -0.843999999999999 | 0.43 | 0.185 | 0.079 | 2.326 | 5.409 |
| -0.841999999999999 | 0.431 | 0.186 | 0.08 | 2.321 | 5.387 |
| -0.839999999999999 | 0.432 | 0.186 | 0.08 | 2.316 | 5.366 |
| -0.837999999999999 | 0.433 | 0.187 | 0.081 | 2.312 | 5.344 |
| -0.835999999999999 | 0.433 | 0.188 | 0.081 | 2.307 | 5.323 |
| -0.833999999999999 | 0.434 | 0.189 | 0.082 | 2.303 | 5.302 |
| -0.831999999999999 | 0.435 | 0.189 | 0.082 | 2.298 | 5.28 |
| -0.829999999999999 | 0.436 | 0.19 | 0.083 | 2.293 | 5.259 |
| -0.827999999999999 | 0.437 | 0.191 | 0.083 | 2.289 | 5.238 |
| -0.825999999999999 | 0.438 | 0.192 | 0.084 | 2.284 | 5.217 |
| -0.823999999999999 | 0.439 | 0.192 | 0.084 | 2.28 | 5.197 |
| -0.821999999999999 | 0.44 | 0.193 | 0.085 | 2.275 | 5.176 |
| -0.819999999999999 | 0.44 | 0.194 | 0.085 | 2.27 | 5.155 |
| -0.817999999999999 | 0.441 | 0.195 | 0.086 | 2.266 | 5.135 |
| -0.815999999999999 | 0.442 | 0.196 | 0.086 | 2.261 | 5.114 |
| -0.813999999999999 | 0.443 | 0.196 | 0.087 | 2.257 | 5.094 |
| -0.811999999999999 | 0.444 | 0.197 | 0.088 | 2.252 | 5.073 |
| -0.809999999999999 | 0.445 | 0.198 | 0.088 | 2.248 | 5.053 |
| -0.807999999999999 | 0.446 | 0.199 | 0.089 | 2.243 | 5.033 |
| -0.805999999999999 | 0.447 | 0.199 | 0.089 | 2.239 | 5.013 |
| -0.803999999999999 | 0.448 | 0.2 | 0.09 | 2.234 | 4.993 |
| -0.801999999999999 | 0.448 | 0.201 | 0.09 | 2.23 | 4.973 |
| -0.799999999999999 | 0.449 | 0.202 | 0.091 | 2.226 | 4.953 |
| -0.797999999999999 | 0.45 | 0.203 | 0.091 | 2.221 | 4.933 |
| -0.795999999999999 | 0.451 | 0.204 | 0.092 | 2.217 | 4.914 |
| -0.793999999999999 | 0.452 | 0.204 | 0.092 | 2.212 | 4.894 |
| -0.791999999999999 | 0.453 | 0.205 | 0.093 | 2.208 | 4.874 |
| -0.789999999999999 | 0.454 | 0.206 | 0.093 | 2.203 | 4.855 |
| -0.787999999999999 | 0.455 | 0.207 | 0.094 | 2.199 | 4.836 |
| -0.785999999999999 | 0.456 | 0.208 | 0.095 | 2.195 | 4.816 |
| -0.783999999999999 | 0.457 | 0.208 | 0.095 | 2.19 | 4.797 |
| -0.781999999999999 | 0.457 | 0.209 | 0.096 | 2.186 | 4.778 |
| -0.779999999999999 | 0.458 | 0.21 | 0.096 | 2.181 | 4.759 |
| -0.777999999999999 | 0.459 | 0.211 | 0.097 | 2.177 | 4.74 |
| -0.775999999999999 | 0.46 | 0.212 | 0.097 | 2.173 | 4.721 |
| -0.773999999999999 | 0.461 | 0.213 | 0.098 | 2.168 | 4.702 |
| -0.771999999999999 | 0.462 | 0.214 | 0.099 | 2.164 | 4.683 |
| -0.769999999999999 | 0.463 | 0.214 | 0.099 | 2.16 | 4.665 |
| -0.767999999999999 | 0.464 | 0.215 | 0.1 | 2.155 | 4.646 |
| -0.765999999999999 | 0.465 | 0.216 | 0.1 | 2.151 | 4.627 |
| -0.763999999999999 | 0.466 | 0.217 | 0.101 | 2.147 | 4.609 |
| -0.761999999999999 | 0.467 | 0.218 | 0.102 | 2.143 | 4.591 |
| -0.759999999999999 | 0.468 | 0.219 | 0.102 | 2.138 | 4.572 |
| -0.757999999999999 | 0.469 | 0.22 | 0.103 | 2.134 | 4.554 |
| -0.755999999999999 | 0.47 | 0.22 | 0.104 | 2.13 | 4.536 |
| -0.753999999999999 | 0.47 | 0.221 | 0.104 | 2.125 | 4.518 |
| -0.751999999999999 | 0.471 | 0.222 | 0.105 | 2.121 | 4.5 |
| -0.749999999999999 | 0.472 | 0.223 | 0.105 | 2.117 | 4.482 |
| -0.747999999999999 | 0.473 | 0.224 | 0.106 | 2.113 | 4.464 |
| -0.745999999999999 | 0.474 | 0.225 | 0.107 | 2.109 | 4.446 |
| -0.743999999999999 | 0.475 | 0.226 | 0.107 | 2.104 | 4.428 |
| -0.741999999999999 | 0.476 | 0.227 | 0.108 | 2.1 | 4.411 |
| -0.739999999999999 | 0.477 | 0.228 | 0.109 | 2.096 | 4.393 |
| -0.737999999999999 | 0.478 | 0.229 | 0.109 | 2.092 | 4.375 |
| -0.735999999999999 | 0.479 | 0.229 | 0.11 | 2.088 | 4.358 |
| -0.733999999999999 | 0.48 | 0.23 | 0.111 | 2.083 | 4.341 |
| -0.731999999999999 | 0.481 | 0.231 | 0.111 | 2.079 | 4.323 |
| -0.729999999999999 | 0.482 | 0.232 | 0.112 | 2.075 | 4.306 |
| -0.727999999999999 | 0.483 | 0.233 | 0.113 | 2.071 | 4.289 |
| -0.725999999999999 | 0.484 | 0.234 | 0.113 | 2.067 | 4.272 |
| -0.723999999999999 | 0.485 | 0.235 | 0.114 | 2.063 | 4.255 |
| -0.721999999999999 | 0.486 | 0.236 | 0.115 | 2.059 | 4.238 |
| -0.719999999999999 | 0.487 | 0.237 | 0.115 | 2.054 | 4.221 |
| -0.717999999999999 | 0.488 | 0.238 | 0.116 | 2.05 | 4.204 |
| -0.715999999999999 | 0.489 | 0.239 | 0.117 | 2.046 | 4.187 |
| -0.713999999999999 | 0.49 | 0.24 | 0.117 | 2.042 | 4.17 |
| -0.711999999999999 | 0.491 | 0.241 | 0.118 | 2.038 | 4.154 |
| -0.709999999999999 | 0.492 | 0.242 | 0.119 | 2.034 | 4.137 |
| -0.707999999999999 | 0.493 | 0.243 | 0.12 | 2.03 | 4.121 |
| -0.705999999999999 | 0.494 | 0.244 | 0.12 | 2.026 | 4.104 |
| -0.703999999999999 | 0.495 | 0.245 | 0.121 | 2.022 | 4.088 |
| -0.701999999999999 | 0.496 | 0.246 | 0.122 | 2.018 | 4.071 |
| -0.699999999999999 | 0.497 | 0.247 | 0.122 | 2.014 | 4.055 |
| -0.697999999999999 | 0.498 | 0.248 | 0.123 | 2.01 | 4.039 |
| -0.695999999999999 | 0.499 | 0.249 | 0.124 | 2.006 | 4.023 |
| -0.693999999999999 | 0.5 | 0.25 | 0.125 | 2.002 | 4.007 |
| -0.691999999999999 | 0.501 | 0.251 | 0.125 | 1.998 | 3.991 |
| -0.689999999999999 | 0.502 | 0.252 | 0.126 | 1.994 | 3.975 |
| -0.687999999999999 | 0.503 | 0.253 | 0.127 | 1.99 | 3.959 |
| -0.685999999999999 | 0.504 | 0.254 | 0.128 | 1.986 | 3.943 |
| -0.683999999999999 | 0.505 | 0.255 | 0.128 | 1.982 | 3.927 |
| -0.681999999999999 | 0.506 | 0.256 | 0.129 | 1.978 | 3.912 |
| -0.679999999999999 | 0.507 | 0.257 | 0.13 | 1.974 | 3.896 |
| -0.677999999999999 | 0.508 | 0.258 | 0.131 | 1.97 | 3.881 |
| -0.675999999999999 | 0.509 | 0.259 | 0.132 | 1.966 | 3.865 |
| -0.673999999999999 | 0.51 | 0.26 | 0.132 | 1.962 | 3.85 |
| -0.671999999999999 | 0.511 | 0.261 | 0.133 | 1.958 | 3.834 |
| -0.669999999999999 | 0.512 | 0.262 | 0.134 | 1.954 | 3.819 |
| -0.667999999999999 | 0.513 | 0.263 | 0.135 | 1.95 | 3.804 |
| -0.665999999999999 | 0.514 | 0.264 | 0.136 | 1.946 | 3.789 |
| -0.663999999999999 | 0.515 | 0.265 | 0.136 | 1.943 | 3.773 |
| -0.661999999999999 | 0.516 | 0.266 | 0.137 | 1.939 | 3.758 |
| -0.659999999999999 | 0.517 | 0.267 | 0.138 | 1.935 | 3.743 |
| -0.657999999999999 | 0.518 | 0.268 | 0.139 | 1.931 | 3.728 |
| -0.655999999999999 | 0.519 | 0.269 | 0.14 | 1.927 | 3.714 |
| -0.653999999999999 | 0.52 | 0.27 | 0.141 | 1.923 | 3.699 |
| -0.651999999999999 | 0.521 | 0.271 | 0.141 | 1.919 | 3.684 |
| -0.649999999999999 | 0.522 | 0.273 | 0.142 | 1.916 | 3.669 |
| -0.647999999999999 | 0.523 | 0.274 | 0.143 | 1.912 | 3.655 |
| -0.645999999999999 | 0.524 | 0.275 | 0.144 | 1.908 | 3.64 |
| -0.643999999999999 | 0.525 | 0.276 | 0.145 | 1.904 | 3.626 |
| -0.641999999999999 | 0.526 | 0.277 | 0.146 | 1.9 | 3.611 |
| -0.639999999999999 | 0.527 | 0.278 | 0.147 | 1.896 | 3.597 |
| -0.637999999999999 | 0.528 | 0.279 | 0.147 | 1.893 | 3.582 |
| -0.635999999999999 | 0.529 | 0.28 | 0.148 | 1.889 | 3.568 |
| -0.633999999999999 | 0.53 | 0.281 | 0.149 | 1.885 | 3.554 |
| -0.631999999999999 | 0.532 | 0.283 | 0.15 | 1.881 | 3.54 |
| -0.629999999999999 | 0.533 | 0.284 | 0.151 | 1.878 | 3.525 |
| -0.627999999999999 | 0.534 | 0.285 | 0.152 | 1.874 | 3.511 |
| -0.625999999999999 | 0.535 | 0.286 | 0.153 | 1.87 | 3.497 |
| -0.623999999999999 | 0.536 | 0.287 | 0.154 | 1.866 | 3.483 |
| -0.621999999999999 | 0.537 | 0.288 | 0.155 | 1.863 | 3.469 |
| -0.619999999999999 | 0.538 | 0.289 | 0.156 | 1.859 | 3.456 |
| -0.617999999999999 | 0.539 | 0.291 | 0.157 | 1.855 | 3.442 |
| -0.615999999999999 | 0.54 | 0.292 | 0.158 | 1.852 | 3.428 |
| -0.613999999999999 | 0.541 | 0.293 | 0.159 | 1.848 | 3.414 |
| -0.611999999999999 | 0.542 | 0.294 | 0.159 | 1.844 | 3.401 |
| -0.609999999999999 | 0.543 | 0.295 | 0.16 | 1.84 | 3.387 |
| -0.607999999999999 | 0.544 | 0.296 | 0.161 | 1.837 | 3.374 |
| -0.605999999999999 | 0.546 | 0.298 | 0.162 | 1.833 | 3.36 |
| -0.603999999999999 | 0.547 | 0.299 | 0.163 | 1.829 | 3.347 |
| -0.601999999999999 | 0.548 | 0.3 | 0.164 | 1.826 | 3.333 |
| -0.599999999999999 | 0.549 | 0.301 | 0.165 | 1.822 | 3.32 |
| -0.597999999999999 | 0.55 | 0.302 | 0.166 | 1.818 | 3.307 |
| -0.595999999999999 | 0.551 | 0.304 | 0.167 | 1.815 | 3.294 |
| -0.593999999999999 | 0.552 | 0.305 | 0.168 | 1.811 | 3.281 |
| -0.591999999999999 | 0.553 | 0.306 | 0.169 | 1.808 | 3.267 |
| -0.589999999999999 | 0.554 | 0.307 | 0.17 | 1.804 | 3.254 |
| -0.587999999999999 | 0.555 | 0.309 | 0.171 | 1.8 | 3.241 |
| -0.585999999999999 | 0.557 | 0.31 | 0.172 | 1.797 | 3.228 |
| -0.583999999999999 | 0.558 | 0.311 | 0.173 | 1.793 | 3.216 |
| -0.581999999999999 | 0.559 | 0.312 | 0.174 | 1.79 | 3.203 |
| -0.579999999999999 | 0.56 | 0.313 | 0.176 | 1.786 | 3.19 |
| -0.577999999999999 | 0.561 | 0.315 | 0.177 | 1.782 | 3.177 |
| -0.575999999999999 | 0.562 | 0.316 | 0.178 | 1.779 | 3.165 |
| -0.573999999999999 | 0.563 | 0.317 | 0.179 | 1.775 | 3.152 |
| -0.571999999999999 | 0.564 | 0.319 | 0.18 | 1.772 | 3.139 |
| -0.569999999999999 | 0.566 | 0.32 | 0.181 | 1.768 | 3.127 |
| -0.567999999999999 | 0.567 | 0.321 | 0.182 | 1.765 | 3.114 |
| -0.565999999999999 | 0.568 | 0.322 | 0.183 | 1.761 | 3.102 |
| -0.563999999999999 | 0.569 | 0.324 | 0.184 | 1.758 | 3.089 |
| -0.561999999999999 | 0.57 | 0.325 | 0.185 | 1.754 | 3.077 |
| -0.559999999999999 | 0.571 | 0.326 | 0.186 | 1.751 | 3.065 |
| -0.557999999999999 | 0.572 | 0.328 | 0.187 | 1.747 | 3.053 |
| -0.555999999999999 | 0.573 | 0.329 | 0.189 | 1.744 | 3.04 |
| -0.553999999999999 | 0.575 | 0.33 | 0.19 | 1.74 | 3.028 |
| -0.551999999999999 | 0.576 | 0.332 | 0.191 | 1.737 | 3.016 |
| -0.549999999999999 | 0.577 | 0.333 | 0.192 | 1.733 | 3.004 |
| -0.547999999999999 | 0.578 | 0.334 | 0.193 | 1.73 | 2.992 |
| -0.545999999999999 | 0.579 | 0.336 | 0.194 | 1.726 | 2.98 |
| -0.543999999999999 | 0.58 | 0.337 | 0.196 | 1.723 | 2.968 |
| -0.541999999999999 | 0.582 | 0.338 | 0.197 | 1.719 | 2.956 |
| -0.539999999999999 | 0.583 | 0.34 | 0.198 | 1.716 | 2.945 |
| -0.537999999999999 | 0.584 | 0.341 | 0.199 | 1.713 | 2.933 |
| -0.535999999999999 | 0.585 | 0.342 | 0.2 | 1.709 | 2.921 |
| -0.533999999999999 | 0.586 | 0.344 | 0.201 | 1.706 | 2.91 |
| -0.531999999999999 | 0.587 | 0.345 | 0.203 | 1.702 | 2.898 |
| -0.529999999999999 | 0.589 | 0.346 | 0.204 | 1.699 | 2.886 |
| -0.527999999999999 | 0.59 | 0.348 | 0.205 | 1.696 | 2.875 |
| -0.525999999999999 | 0.591 | 0.349 | 0.206 | 1.692 | 2.863 |
| -0.523999999999999 | 0.592 | 0.351 | 0.208 | 1.689 | 2.852 |
| -0.521999999999999 | 0.593 | 0.352 | 0.209 | 1.685 | 2.841 |
| -0.519999999999999 | 0.595 | 0.353 | 0.21 | 1.682 | 2.829 |
| -0.517999999999999 | 0.596 | 0.355 | 0.211 | 1.679 | 2.818 |
| -0.515999999999999 | 0.597 | 0.356 | 0.213 | 1.675 | 2.807 |
| -0.513999999999999 | 0.598 | 0.358 | 0.214 | 1.672 | 2.795 |
| -0.511999999999999 | 0.599 | 0.359 | 0.215 | 1.669 | 2.784 |
| -0.509999999999999 | 0.6 | 0.361 | 0.217 | 1.665 | 2.773 |
| -0.507999999999999 | 0.602 | 0.362 | 0.218 | 1.662 | 2.762 |
| -0.505999999999999 | 0.603 | 0.363 | 0.219 | 1.659 | 2.751 |
| -0.503999999999999 | 0.604 | 0.365 | 0.22 | 1.655 | 2.74 |
| -0.501999999999999 | 0.605 | 0.366 | 0.222 | 1.652 | 2.729 |
| -0.499999999999999 | 0.607 | 0.368 | 0.223 | 1.649 | 2.718 |
| -0.497999999999999 | 0.608 | 0.369 | 0.224 | 1.645 | 2.707 |
| -0.495999999999999 | 0.609 | 0.371 | 0.226 | 1.642 | 2.697 |
| -0.493999999999999 | 0.61 | 0.372 | 0.227 | 1.639 | 2.686 |
| -0.491999999999999 | 0.611 | 0.374 | 0.229 | 1.636 | 2.675 |
| -0.489999999999999 | 0.613 | 0.375 | 0.23 | 1.632 | 2.664 |
| -0.487999999999999 | 0.614 | 0.377 | 0.231 | 1.629 | 2.654 |
| -0.485999999999999 | 0.615 | 0.378 | 0.233 | 1.626 | 2.643 |
| -0.483999999999999 | 0.616 | 0.38 | 0.234 | 1.623 | 2.633 |
| -0.481999999999999 | 0.618 | 0.381 | 0.236 | 1.619 | 2.622 |
| -0.479999999999999 | 0.619 | 0.383 | 0.237 | 1.616 | 2.612 |
| -0.477999999999999 | 0.62 | 0.384 | 0.238 | 1.613 | 2.601 |
| -0.475999999999999 | 0.621 | 0.386 | 0.24 | 1.61 | 2.591 |
| -0.473999999999999 | 0.623 | 0.388 | 0.241 | 1.606 | 2.581 |
| -0.471999999999999 | 0.624 | 0.389 | 0.243 | 1.603 | 2.57 |
| -0.469999999999999 | 0.625 | 0.391 | 0.244 | 1.6 | 2.56 |
| -0.467999999999999 | 0.626 | 0.392 | 0.246 | 1.597 | 2.55 |
| -0.465999999999999 | 0.628 | 0.394 | 0.247 | 1.594 | 2.54 |
| -0.463999999999999 | 0.629 | 0.395 | 0.249 | 1.59 | 2.529 |
| -0.461999999999999 | 0.63 | 0.397 | 0.25 | 1.587 | 2.519 |
| -0.459999999999999 | 0.631 | 0.399 | 0.252 | 1.584 | 2.509 |
| -0.457999999999999 | 0.633 | 0.4 | 0.253 | 1.581 | 2.499 |
| -0.455999999999999 | 0.634 | 0.402 | 0.255 | 1.578 | 2.489 |
| -0.453999999999999 | 0.635 | 0.403 | 0.256 | 1.575 | 2.479 |
| -0.451999999999999 | 0.636 | 0.405 | 0.258 | 1.571 | 2.469 |
| -0.449999999999999 | 0.638 | 0.407 | 0.259 | 1.568 | 2.46 |
| -0.447999999999999 | 0.639 | 0.408 | 0.261 | 1.565 | 2.45 |
| -0.445999999999999 | 0.64 | 0.41 | 0.262 | 1.562 | 2.44 |
| -0.443999999999999 | 0.641 | 0.411 | 0.264 | 1.559 | 2.43 |
| -0.441999999999999 | 0.643 | 0.413 | 0.266 | 1.556 | 2.421 |
| -0.439999999999999 | 0.644 | 0.415 | 0.267 | 1.553 | 2.411 |
| -0.437999999999999 | 0.645 | 0.416 | 0.269 | 1.55 | 2.401 |
| -0.435999999999999 | 0.647 | 0.418 | 0.27 | 1.547 | 2.392 |
| -0.433999999999999 | 0.648 | 0.42 | 0.272 | 1.543 | 2.382 |
| -0.431999999999999 | 0.649 | 0.421 | 0.274 | 1.54 | 2.373 |
| -0.429999999999999 | 0.651 | 0.423 | 0.275 | 1.537 | 2.363 |
| -0.427999999999999 | 0.652 | 0.425 | 0.277 | 1.534 | 2.354 |
| -0.425999999999999 | 0.653 | 0.427 | 0.279 | 1.531 | 2.344 |
| -0.423999999999999 | 0.654 | 0.428 | 0.28 | 1.528 | 2.335 |
| -0.421999999999999 | 0.656 | 0.43 | 0.282 | 1.525 | 2.326 |
| -0.419999999999999 | 0.657 | 0.432 | 0.284 | 1.522 | 2.316 |
| -0.417999999999999 | 0.658 | 0.433 | 0.285 | 1.519 | 2.307 |
| -0.415999999999999 | 0.66 | 0.435 | 0.287 | 1.516 | 2.298 |
| -0.413999999999999 | 0.661 | 0.437 | 0.289 | 1.513 | 2.289 |
| -0.411999999999999 | 0.662 | 0.439 | 0.291 | 1.51 | 2.28 |
| -0.409999999999999 | 0.664 | 0.44 | 0.292 | 1.507 | 2.27 |
| -0.407999999999999 | 0.665 | 0.442 | 0.294 | 1.504 | 2.261 |
| -0.405999999999999 | 0.666 | 0.444 | 0.296 | 1.501 | 2.252 |
| -0.403999999999999 | 0.668 | 0.446 | 0.298 | 1.498 | 2.243 |
| -0.401999999999999 | 0.669 | 0.448 | 0.299 | 1.495 | 2.234 |
| -0.399999999999999 | 0.67 | 0.449 | 0.301 | 1.492 | 2.226 |
| -0.397999999999999 | 0.672 | 0.451 | 0.303 | 1.489 | 2.217 |
| -0.395999999999999 | 0.673 | 0.453 | 0.305 | 1.486 | 2.208 |
| -0.393999999999999 | 0.674 | 0.455 | 0.307 | 1.483 | 2.199 |
| -0.391999999999999 | 0.676 | 0.457 | 0.309 | 1.48 | 2.19 |
| -0.389999999999999 | 0.677 | 0.458 | 0.31 | 1.477 | 2.181 |
| -0.387999999999999 | 0.678 | 0.46 | 0.312 | 1.474 | 2.173 |
| -0.385999999999999 | 0.68 | 0.462 | 0.314 | 1.471 | 2.164 |
| -0.383999999999999 | 0.681 | 0.464 | 0.316 | 1.468 | 2.155 |
| -0.381999999999999 | 0.682 | 0.466 | 0.318 | 1.465 | 2.147 |
| -0.379999999999999 | 0.684 | 0.468 | 0.32 | 1.462 | 2.138 |
| -0.377999999999999 | 0.685 | 0.47 | 0.322 | 1.459 | 2.13 |
| -0.375999999999999 | 0.687 | 0.471 | 0.324 | 1.456 | 2.121 |
| -0.373999999999999 | 0.688 | 0.473 | 0.326 | 1.454 | 2.113 |
| -0.371999999999999 | 0.689 | 0.475 | 0.328 | 1.451 | 2.104 |
| -0.369999999999998 | 0.691 | 0.477 | 0.33 | 1.448 | 2.096 |
| -0.367999999999998 | 0.692 | 0.479 | 0.332 | 1.445 | 2.088 |
| -0.365999999999998 | 0.694 | 0.481 | 0.334 | 1.442 | 2.079 |
| -0.363999999999998 | 0.695 | 0.483 | 0.336 | 1.439 | 2.071 |
| -0.361999999999998 | 0.696 | 0.485 | 0.338 | 1.436 | 2.063 |
| -0.359999999999998 | 0.698 | 0.487 | 0.34 | 1.433 | 2.054 |
| -0.357999999999998 | 0.699 | 0.489 | 0.342 | 1.43 | 2.046 |
| -0.355999999999998 | 0.7 | 0.491 | 0.344 | 1.428 | 2.038 |
| -0.353999999999998 | 0.702 | 0.493 | 0.346 | 1.425 | 2.03 |
| -0.351999999999998 | 0.703 | 0.495 | 0.348 | 1.422 | 2.022 |
| -0.349999999999998 | 0.705 | 0.497 | 0.35 | 1.419 | 2.014 |
| -0.347999999999998 | 0.706 | 0.499 | 0.352 | 1.416 | 2.006 |
| -0.345999999999998 | 0.708 | 0.501 | 0.354 | 1.413 | 1.998 |
| -0.343999999999998 | 0.709 | 0.503 | 0.356 | 1.411 | 1.99 |
| -0.341999999999998 | 0.71 | 0.505 | 0.358 | 1.408 | 1.982 |
| -0.339999999999998 | 0.712 | 0.507 | 0.361 | 1.405 | 1.974 |
| -0.337999999999998 | 0.713 | 0.509 | 0.363 | 1.402 | 1.966 |
| -0.335999999999998 | 0.715 | 0.511 | 0.365 | 1.399 | 1.958 |
| -0.333999999999998 | 0.716 | 0.513 | 0.367 | 1.397 | 1.95 |
| -0.331999999999998 | 0.717 | 0.515 | 0.369 | 1.394 | 1.943 |
| -0.329999999999998 | 0.719 | 0.517 | 0.372 | 1.391 | 1.935 |
| -0.327999999999998 | 0.72 | 0.519 | 0.374 | 1.388 | 1.927 |
| -0.325999999999998 | 0.722 | 0.521 | 0.376 | 1.385 | 1.919 |
| -0.323999999999998 | 0.723 | 0.523 | 0.378 | 1.383 | 1.912 |
| -0.321999999999998 | 0.725 | 0.525 | 0.381 | 1.38 | 1.904 |
| -0.319999999999998 | 0.726 | 0.527 | 0.383 | 1.377 | 1.896 |
| -0.317999999999998 | 0.728 | 0.529 | 0.385 | 1.374 | 1.889 |
| -0.315999999999998 | 0.729 | 0.532 | 0.388 | 1.372 | 1.881 |
| -0.313999999999998 | 0.731 | 0.534 | 0.39 | 1.369 | 1.874 |
| -0.311999999999998 | 0.732 | 0.536 | 0.392 | 1.366 | 1.866 |
| -0.309999999999998 | 0.733 | 0.538 | 0.395 | 1.363 | 1.859 |
| -0.307999999999998 | 0.735 | 0.54 | 0.397 | 1.361 | 1.852 |
| -0.305999999999998 | 0.736 | 0.542 | 0.399 | 1.358 | 1.844 |
| -0.303999999999998 | 0.738 | 0.544 | 0.402 | 1.355 | 1.837 |
| -0.301999999999998 | 0.739 | 0.547 | 0.404 | 1.353 | 1.829 |
| -0.299999999999998 | 0.741 | 0.549 | 0.407 | 1.35 | 1.822 |
| -0.297999999999998 | 0.742 | 0.551 | 0.409 | 1.347 | 1.815 |
| -0.295999999999998 | 0.744 | 0.553 | 0.411 | 1.344 | 1.808 |
| -0.293999999999998 | 0.745 | 0.555 | 0.414 | 1.342 | 1.8 |
| -0.291999999999998 | 0.747 | 0.558 | 0.416 | 1.339 | 1.793 |
| -0.289999999999998 | 0.748 | 0.56 | 0.419 | 1.336 | 1.786 |
| -0.287999999999998 | 0.75 | 0.562 | 0.421 | 1.334 | 1.779 |
| -0.285999999999998 | 0.751 | 0.564 | 0.424 | 1.331 | 1.772 |
| -0.283999999999998 | 0.753 | 0.567 | 0.427 | 1.328 | 1.765 |
| -0.281999999999998 | 0.754 | 0.569 | 0.429 | 1.326 | 1.758 |
| -0.279999999999998 | 0.756 | 0.571 | 0.432 | 1.323 | 1.751 |
| -0.277999999999998 | 0.757 | 0.573 | 0.434 | 1.32 | 1.744 |
| -0.275999999999998 | 0.759 | 0.576 | 0.437 | 1.318 | 1.737 |
| -0.273999999999998 | 0.76 | 0.578 | 0.44 | 1.315 | 1.73 |
| -0.271999999999998 | 0.762 | 0.58 | 0.442 | 1.313 | 1.723 |
| -0.269999999999998 | 0.763 | 0.583 | 0.445 | 1.31 | 1.716 |
| -0.267999999999998 | 0.765 | 0.585 | 0.448 | 1.307 | 1.709 |
| -0.265999999999998 | 0.766 | 0.587 | 0.45 | 1.305 | 1.702 |
| -0.263999999999998 | 0.768 | 0.59 | 0.453 | 1.302 | 1.696 |
| -0.261999999999998 | 0.77 | 0.592 | 0.456 | 1.3 | 1.689 |
| -0.259999999999998 | 0.771 | 0.595 | 0.458 | 1.297 | 1.682 |
| -0.257999999999998 | 0.773 | 0.597 | 0.461 | 1.294 | 1.675 |
| -0.255999999999998 | 0.774 | 0.599 | 0.464 | 1.292 | 1.669 |
| -0.253999999999998 | 0.776 | 0.602 | 0.467 | 1.289 | 1.662 |
| -0.251999999999998 | 0.777 | 0.604 | 0.47 | 1.287 | 1.655 |
| -0.249999999999998 | 0.779 | 0.607 | 0.472 | 1.284 | 1.649 |
| -0.247999999999998 | 0.78 | 0.609 | 0.475 | 1.281 | 1.642 |
| -0.245999999999998 | 0.782 | 0.611 | 0.478 | 1.279 | 1.636 |
| -0.243999999999998 | 0.783 | 0.614 | 0.481 | 1.276 | 1.629 |
| -0.241999999999998 | 0.785 | 0.616 | 0.484 | 1.274 | 1.623 |
| -0.239999999999998 | 0.787 | 0.619 | 0.487 | 1.271 | 1.616 |
| -0.237999999999998 | 0.788 | 0.621 | 0.49 | 1.269 | 1.61 |
| -0.235999999999998 | 0.79 | 0.624 | 0.493 | 1.266 | 1.603 |
| -0.233999999999998 | 0.791 | 0.626 | 0.496 | 1.264 | 1.597 |
| -0.231999999999998 | 0.793 | 0.629 | 0.499 | 1.261 | 1.59 |
| -0.229999999999998 | 0.795 | 0.631 | 0.502 | 1.259 | 1.584 |
| -0.227999999999998 | 0.796 | 0.634 | 0.505 | 1.256 | 1.578 |
| -0.225999999999998 | 0.798 | 0.636 | 0.508 | 1.254 | 1.571 |
| -0.223999999999998 | 0.799 | 0.639 | 0.511 | 1.251 | 1.565 |
| -0.221999999999998 | 0.801 | 0.641 | 0.514 | 1.249 | 1.559 |
| -0.219999999999998 | 0.803 | 0.644 | 0.517 | 1.246 | 1.553 |
| -0.217999999999998 | 0.804 | 0.647 | 0.52 | 1.244 | 1.547 |
| -0.215999999999998 | 0.806 | 0.649 | 0.523 | 1.241 | 1.54 |
| -0.213999999999998 | 0.807 | 0.652 | 0.526 | 1.239 | 1.534 |
| -0.211999999999998 | 0.809 | 0.654 | 0.529 | 1.236 | 1.528 |
| -0.209999999999998 | 0.811 | 0.657 | 0.533 | 1.234 | 1.522 |
| -0.207999999999998 | 0.812 | 0.66 | 0.536 | 1.231 | 1.516 |
| -0.205999999999998 | 0.814 | 0.662 | 0.539 | 1.229 | 1.51 |
| -0.203999999999998 | 0.815 | 0.665 | 0.542 | 1.226 | 1.504 |
| -0.201999999999998 | 0.817 | 0.668 | 0.546 | 1.224 | 1.498 |
| -0.199999999999998 | 0.819 | 0.67 | 0.549 | 1.221 | 1.492 |
| -0.197999999999998 | 0.82 | 0.673 | 0.552 | 1.219 | 1.486 |
| -0.195999999999998 | 0.822 | 0.676 | 0.555 | 1.217 | 1.48 |
| -0.193999999999998 | 0.824 | 0.678 | 0.559 | 1.214 | 1.474 |
| -0.191999999999998 | 0.825 | 0.681 | 0.562 | 1.212 | 1.468 |
| -0.189999999999998 | 0.827 | 0.684 | 0.566 | 1.209 | 1.462 |
| -0.187999999999998 | 0.829 | 0.687 | 0.569 | 1.207 | 1.456 |
| -0.185999999999998 | 0.83 | 0.689 | 0.572 | 1.204 | 1.451 |
| -0.183999999999998 | 0.832 | 0.692 | 0.576 | 1.202 | 1.445 |
| -0.181999999999998 | 0.834 | 0.695 | 0.579 | 1.2 | 1.439 |
| -0.179999999999998 | 0.835 | 0.698 | 0.583 | 1.197 | 1.433 |
| -0.177999999999998 | 0.837 | 0.7 | 0.586 | 1.195 | 1.428 |
| -0.175999999999998 | 0.839 | 0.703 | 0.59 | 1.192 | 1.422 |
| -0.173999999999998 | 0.84 | 0.706 | 0.593 | 1.19 | 1.416 |
| -0.171999999999998 | 0.842 | 0.709 | 0.597 | 1.188 | 1.411 |
| -0.169999999999998 | 0.844 | 0.712 | 0.6 | 1.185 | 1.405 |
| -0.167999999999998 | 0.845 | 0.715 | 0.604 | 1.183 | 1.399 |
| -0.165999999999998 | 0.847 | 0.717 | 0.608 | 1.181 | 1.394 |
| -0.163999999999998 | 0.849 | 0.72 | 0.611 | 1.178 | 1.388 |
| -0.161999999999998 | 0.85 | 0.723 | 0.615 | 1.176 | 1.383 |
| -0.159999999999998 | 0.852 | 0.726 | 0.619 | 1.174 | 1.377 |
| -0.157999999999998 | 0.854 | 0.729 | 0.623 | 1.171 | 1.372 |
| -0.155999999999998 | 0.856 | 0.732 | 0.626 | 1.169 | 1.366 |
| -0.153999999999998 | 0.857 | 0.735 | 0.63 | 1.166 | 1.361 |
| -0.151999999999998 | 0.859 | 0.738 | 0.634 | 1.164 | 1.355 |
| -0.149999999999998 | 0.861 | 0.741 | 0.638 | 1.162 | 1.35 |
| -0.147999999999998 | 0.862 | 0.744 | 0.641 | 1.16 | 1.344 |
| -0.145999999999998 | 0.864 | 0.747 | 0.645 | 1.157 | 1.339 |
| -0.143999999999998 | 0.866 | 0.75 | 0.649 | 1.155 | 1.334 |
| -0.141999999999998 | 0.868 | 0.753 | 0.653 | 1.153 | 1.328 |
| -0.139999999999998 | 0.869 | 0.756 | 0.657 | 1.15 | 1.323 |
| -0.137999999999998 | 0.871 | 0.759 | 0.661 | 1.148 | 1.318 |
| -0.135999999999998 | 0.873 | 0.762 | 0.665 | 1.146 | 1.313 |
| -0.133999999999998 | 0.875 | 0.765 | 0.669 | 1.143 | 1.307 |
| -0.131999999999998 | 0.876 | 0.768 | 0.673 | 1.141 | 1.302 |
| -0.129999999999998 | 0.878 | 0.771 | 0.677 | 1.139 | 1.297 |
| -0.127999999999998 | 0.88 | 0.774 | 0.681 | 1.137 | 1.292 |
| -0.125999999999998 | 0.882 | 0.777 | 0.685 | 1.134 | 1.287 |
| -0.123999999999998 | 0.883 | 0.78 | 0.689 | 1.132 | 1.281 |
| -0.121999999999998 | 0.885 | 0.783 | 0.694 | 1.13 | 1.276 |
| -0.119999999999998 | 0.887 | 0.787 | 0.698 | 1.127 | 1.271 |
| -0.117999999999998 | 0.889 | 0.79 | 0.702 | 1.125 | 1.266 |
| -0.115999999999998 | 0.89 | 0.793 | 0.706 | 1.123 | 1.261 |
| -0.113999999999998 | 0.892 | 0.796 | 0.71 | 1.121 | 1.256 |
| -0.111999999999998 | 0.894 | 0.799 | 0.715 | 1.119 | 1.251 |
| -0.109999999999998 | 0.896 | 0.803 | 0.719 | 1.116 | 1.246 |
| -0.107999999999998 | 0.898 | 0.806 | 0.723 | 1.114 | 1.241 |
| -0.105999999999998 | 0.899 | 0.809 | 0.728 | 1.112 | 1.236 |
| -0.103999999999998 | 0.901 | 0.812 | 0.732 | 1.11 | 1.231 |
| -0.101999999999998 | 0.903 | 0.815 | 0.736 | 1.107 | 1.226 |
| -0.0999999999999983 | 0.905 | 0.819 | 0.741 | 1.105 | 1.221 |
| -0.0979999999999983 | 0.907 | 0.822 | 0.745 | 1.103 | 1.217 |
| -0.0959999999999983 | 0.908 | 0.825 | 0.75 | 1.101 | 1.212 |
| -0.0939999999999983 | 0.91 | 0.829 | 0.754 | 1.099 | 1.207 |
| -0.0919999999999983 | 0.912 | 0.832 | 0.759 | 1.096 | 1.202 |
| -0.0899999999999983 | 0.914 | 0.835 | 0.763 | 1.094 | 1.197 |
| -0.0879999999999983 | 0.916 | 0.839 | 0.768 | 1.092 | 1.192 |
| -0.0859999999999983 | 0.918 | 0.842 | 0.773 | 1.09 | 1.188 |
| -0.0839999999999983 | 0.919 | 0.845 | 0.777 | 1.088 | 1.183 |
| -0.0819999999999983 | 0.921 | 0.849 | 0.782 | 1.085 | 1.178 |
| -0.0799999999999983 | 0.923 | 0.852 | 0.787 | 1.083 | 1.174 |
| -0.0779999999999983 | 0.925 | 0.856 | 0.791 | 1.081 | 1.169 |
| -0.0759999999999983 | 0.927 | 0.859 | 0.796 | 1.079 | 1.164 |
| -0.0739999999999983 | 0.929 | 0.862 | 0.801 | 1.077 | 1.16 |
| -0.0719999999999983 | 0.931 | 0.866 | 0.806 | 1.075 | 1.155 |
| -0.0699999999999983 | 0.932 | 0.869 | 0.811 | 1.073 | 1.15 |
| -0.0679999999999983 | 0.934 | 0.873 | 0.815 | 1.07 | 1.146 |
| -0.0659999999999983 | 0.936 | 0.876 | 0.82 | 1.068 | 1.141 |
| -0.0639999999999983 | 0.938 | 0.88 | 0.825 | 1.066 | 1.137 |
| -0.0619999999999983 | 0.94 | 0.883 | 0.83 | 1.064 | 1.132 |
| -0.0599999999999983 | 0.942 | 0.887 | 0.835 | 1.062 | 1.127 |
| -0.0579999999999983 | 0.944 | 0.89 | 0.84 | 1.06 | 1.123 |
| -0.0559999999999983 | 0.946 | 0.894 | 0.845 | 1.058 | 1.119 |
| -0.0539999999999983 | 0.947 | 0.898 | 0.85 | 1.055 | 1.114 |
| -0.0519999999999983 | 0.949 | 0.901 | 0.856 | 1.053 | 1.11 |
| -0.0499999999999983 | 0.951 | 0.905 | 0.861 | 1.051 | 1.105 |
| -0.0479999999999983 | 0.953 | 0.908 | 0.866 | 1.049 | 1.101 |
| -0.0459999999999983 | 0.955 | 0.912 | 0.871 | 1.047 | 1.096 |
| -0.0439999999999983 | 0.957 | 0.916 | 0.876 | 1.045 | 1.092 |
| -0.0419999999999983 | 0.959 | 0.919 | 0.882 | 1.043 | 1.088 |
| -0.0399999999999983 | 0.961 | 0.923 | 0.887 | 1.041 | 1.083 |
| -0.0379999999999982 | 0.963 | 0.927 | 0.892 | 1.039 | 1.079 |
| -0.0359999999999982 | 0.965 | 0.931 | 0.898 | 1.037 | 1.075 |
| -0.0339999999999982 | 0.967 | 0.934 | 0.903 | 1.035 | 1.07 |
| -0.0319999999999982 | 0.969 | 0.938 | 0.908 | 1.033 | 1.066 |
| -0.0299999999999982 | 0.97 | 0.942 | 0.914 | 1.03 | 1.062 |
| -0.0279999999999982 | 0.972 | 0.946 | 0.919 | 1.028 | 1.058 |
| -0.0259999999999982 | 0.974 | 0.949 | 0.925 | 1.026 | 1.053 |
| -0.0239999999999982 | 0.976 | 0.953 | 0.931 | 1.024 | 1.049 |
| -0.0219999999999982 | 0.978 | 0.957 | 0.936 | 1.022 | 1.045 |
| -0.0199999999999982 | 0.98 | 0.961 | 0.942 | 1.02 | 1.041 |
| -0.0179999999999982 | 0.982 | 0.965 | 0.947 | 1.018 | 1.037 |
| -0.0159999999999982 | 0.984 | 0.969 | 0.953 | 1.016 | 1.033 |
| -0.0139999999999982 | 0.986 | 0.972 | 0.959 | 1.014 | 1.028 |
| -0.0119999999999982 | 0.988 | 0.976 | 0.965 | 1.012 | 1.024 |
| -0.00999999999999823 | 0.99 | 0.98 | 0.97 | 1.01 | 1.02 |
| -0.00799999999999824 | 0.992 | 0.984 | 0.976 | 1.008 | 1.016 |
| -0.00599999999999824 | 0.994 | 0.988 | 0.982 | 1.006 | 1.012 |
| -0.00399999999999824 | 0.996 | 0.992 | 0.988 | 1.004 | 1.008 |
| -0.00199999999999824 | 0.998 | 0.996 | 0.994 | 1.002 | 1.004 |
| 1.76247905159244e-15 | 1 | 1 | 1 | 1 | 1 |
| 0.00200000000000176 | 1.002 | 1.004 | 1.006 | 0.998 | 0.996 |
| 0.00400000000000176 | 1.004 | 1.008 | 1.012 | 0.996 | 0.992 |
| 0.00600000000000176 | 1.006 | 1.012 | 1.018 | 0.994 | 0.988 |
| 0.00800000000000176 | 1.008 | 1.016 | 1.024 | 0.992 | 0.984 |
| 0.0100000000000018 | 1.01 | 1.02 | 1.03 | 0.99 | 0.98 |
| 0.0120000000000018 | 1.012 | 1.024 | 1.037 | 0.988 | 0.976 |
| 0.0140000000000018 | 1.014 | 1.028 | 1.043 | 0.986 | 0.972 |
| 0.0160000000000018 | 1.016 | 1.033 | 1.049 | 0.984 | 0.969 |
| 0.0180000000000018 | 1.018 | 1.037 | 1.055 | 0.982 | 0.965 |
| 0.0200000000000018 | 1.02 | 1.041 | 1.062 | 0.98 | 0.961 |
| 0.0220000000000018 | 1.022 | 1.045 | 1.068 | 0.978 | 0.957 |
| 0.0240000000000018 | 1.024 | 1.049 | 1.075 | 0.976 | 0.953 |
| 0.0260000000000018 | 1.026 | 1.053 | 1.081 | 0.974 | 0.949 |
| 0.0280000000000018 | 1.028 | 1.058 | 1.088 | 0.972 | 0.946 |
| 0.0300000000000018 | 1.03 | 1.062 | 1.094 | 0.97 | 0.942 |
| 0.0320000000000018 | 1.033 | 1.066 | 1.101 | 0.969 | 0.938 |
| 0.0340000000000018 | 1.035 | 1.07 | 1.107 | 0.967 | 0.934 |
| 0.0360000000000018 | 1.037 | 1.075 | 1.114 | 0.965 | 0.931 |
| 0.0380000000000018 | 1.039 | 1.079 | 1.121 | 0.963 | 0.927 |
| 0.0400000000000018 | 1.041 | 1.083 | 1.127 | 0.961 | 0.923 |
| 0.0420000000000018 | 1.043 | 1.088 | 1.134 | 0.959 | 0.919 |
| 0.0440000000000018 | 1.045 | 1.092 | 1.141 | 0.957 | 0.916 |
| 0.0460000000000018 | 1.047 | 1.096 | 1.148 | 0.955 | 0.912 |
| 0.0480000000000018 | 1.049 | 1.101 | 1.155 | 0.953 | 0.908 |
| 0.0500000000000018 | 1.051 | 1.105 | 1.162 | 0.951 | 0.905 |
| 0.0520000000000018 | 1.053 | 1.11 | 1.169 | 0.949 | 0.901 |
| 0.0540000000000018 | 1.055 | 1.114 | 1.176 | 0.947 | 0.898 |
| 0.0560000000000018 | 1.058 | 1.119 | 1.183 | 0.946 | 0.894 |
| 0.0580000000000018 | 1.06 | 1.123 | 1.19 | 0.944 | 0.89 |
| 0.0600000000000018 | 1.062 | 1.127 | 1.197 | 0.942 | 0.887 |
| 0.0620000000000018 | 1.064 | 1.132 | 1.204 | 0.94 | 0.883 |
| 0.0640000000000018 | 1.066 | 1.137 | 1.212 | 0.938 | 0.88 |
| 0.0660000000000018 | 1.068 | 1.141 | 1.219 | 0.936 | 0.876 |
| 0.0680000000000018 | 1.07 | 1.146 | 1.226 | 0.934 | 0.873 |
| 0.0700000000000018 | 1.073 | 1.15 | 1.234 | 0.932 | 0.869 |
| 0.0720000000000018 | 1.075 | 1.155 | 1.241 | 0.931 | 0.866 |
| 0.0740000000000018 | 1.077 | 1.16 | 1.249 | 0.929 | 0.862 |
| 0.0760000000000018 | 1.079 | 1.164 | 1.256 | 0.927 | 0.859 |
| 0.0780000000000018 | 1.081 | 1.169 | 1.264 | 0.925 | 0.856 |
| 0.0800000000000018 | 1.083 | 1.174 | 1.271 | 0.923 | 0.852 |
| 0.0820000000000018 | 1.085 | 1.178 | 1.279 | 0.921 | 0.849 |
| 0.0840000000000018 | 1.088 | 1.183 | 1.287 | 0.919 | 0.845 |
| 0.0860000000000018 | 1.09 | 1.188 | 1.294 | 0.918 | 0.842 |
| 0.0880000000000018 | 1.092 | 1.192 | 1.302 | 0.916 | 0.839 |
| 0.0900000000000018 | 1.094 | 1.197 | 1.31 | 0.914 | 0.835 |
| 0.0920000000000018 | 1.096 | 1.202 | 1.318 | 0.912 | 0.832 |
| 0.0940000000000018 | 1.099 | 1.207 | 1.326 | 0.91 | 0.829 |
| 0.0960000000000018 | 1.101 | 1.212 | 1.334 | 0.908 | 0.825 |
| 0.0980000000000018 | 1.103 | 1.217 | 1.342 | 0.907 | 0.822 |
| 0.100000000000002 | 1.105 | 1.221 | 1.35 | 0.905 | 0.819 |
| 0.102000000000002 | 1.107 | 1.226 | 1.358 | 0.903 | 0.815 |
| 0.104000000000002 | 1.11 | 1.231 | 1.366 | 0.901 | 0.812 |
| 0.106000000000002 | 1.112 | 1.236 | 1.374 | 0.899 | 0.809 |
| 0.108000000000002 | 1.114 | 1.241 | 1.383 | 0.898 | 0.806 |
| 0.110000000000002 | 1.116 | 1.246 | 1.391 | 0.896 | 0.803 |
| 0.112000000000002 | 1.119 | 1.251 | 1.399 | 0.894 | 0.799 |
| 0.114000000000002 | 1.121 | 1.256 | 1.408 | 0.892 | 0.796 |
| 0.116000000000002 | 1.123 | 1.261 | 1.416 | 0.89 | 0.793 |
| 0.118000000000002 | 1.125 | 1.266 | 1.425 | 0.889 | 0.79 |
| 0.120000000000002 | 1.127 | 1.271 | 1.433 | 0.887 | 0.787 |
| 0.122000000000002 | 1.13 | 1.276 | 1.442 | 0.885 | 0.783 |
| 0.124000000000002 | 1.132 | 1.281 | 1.451 | 0.883 | 0.78 |
| 0.126000000000002 | 1.134 | 1.287 | 1.459 | 0.882 | 0.777 |
| 0.128000000000002 | 1.137 | 1.292 | 1.468 | 0.88 | 0.774 |
| 0.130000000000002 | 1.139 | 1.297 | 1.477 | 0.878 | 0.771 |
| 0.132000000000002 | 1.141 | 1.302 | 1.486 | 0.876 | 0.768 |
| 0.134000000000002 | 1.143 | 1.307 | 1.495 | 0.875 | 0.765 |
| 0.136000000000002 | 1.146 | 1.313 | 1.504 | 0.873 | 0.762 |
| 0.138000000000002 | 1.148 | 1.318 | 1.513 | 0.871 | 0.759 |
| 0.140000000000002 | 1.15 | 1.323 | 1.522 | 0.869 | 0.756 |
| 0.142000000000002 | 1.153 | 1.328 | 1.531 | 0.868 | 0.753 |
| 0.144000000000002 | 1.155 | 1.334 | 1.54 | 0.866 | 0.75 |
| 0.146000000000002 | 1.157 | 1.339 | 1.55 | 0.864 | 0.747 |
| 0.148000000000002 | 1.16 | 1.344 | 1.559 | 0.862 | 0.744 |
| 0.150000000000002 | 1.162 | 1.35 | 1.568 | 0.861 | 0.741 |
| 0.152000000000002 | 1.164 | 1.355 | 1.578 | 0.859 | 0.738 |
| 0.154000000000002 | 1.166 | 1.361 | 1.587 | 0.857 | 0.735 |
| 0.156000000000002 | 1.169 | 1.366 | 1.597 | 0.856 | 0.732 |
| 0.158000000000002 | 1.171 | 1.372 | 1.606 | 0.854 | 0.729 |
| 0.160000000000002 | 1.174 | 1.377 | 1.616 | 0.852 | 0.726 |
| 0.162000000000002 | 1.176 | 1.383 | 1.626 | 0.85 | 0.723 |
| 0.164000000000002 | 1.178 | 1.388 | 1.636 | 0.849 | 0.72 |
| 0.166000000000002 | 1.181 | 1.394 | 1.645 | 0.847 | 0.717 |
| 0.168000000000002 | 1.183 | 1.399 | 1.655 | 0.845 | 0.715 |
| 0.170000000000002 | 1.185 | 1.405 | 1.665 | 0.844 | 0.712 |
| 0.172000000000002 | 1.188 | 1.411 | 1.675 | 0.842 | 0.709 |
| 0.174000000000002 | 1.19 | 1.416 | 1.685 | 0.84 | 0.706 |
| 0.176000000000002 | 1.192 | 1.422 | 1.696 | 0.839 | 0.703 |
| 0.178000000000002 | 1.195 | 1.428 | 1.706 | 0.837 | 0.7 |
| 0.180000000000002 | 1.197 | 1.433 | 1.716 | 0.835 | 0.698 |
| 0.182000000000002 | 1.2 | 1.439 | 1.726 | 0.834 | 0.695 |
| 0.184000000000002 | 1.202 | 1.445 | 1.737 | 0.832 | 0.692 |
| 0.186000000000002 | 1.204 | 1.451 | 1.747 | 0.83 | 0.689 |
| 0.188000000000002 | 1.207 | 1.456 | 1.758 | 0.829 | 0.687 |
| 0.190000000000002 | 1.209 | 1.462 | 1.768 | 0.827 | 0.684 |
| 0.192000000000002 | 1.212 | 1.468 | 1.779 | 0.825 | 0.681 |
| 0.194000000000002 | 1.214 | 1.474 | 1.79 | 0.824 | 0.678 |
| 0.196000000000002 | 1.217 | 1.48 | 1.8 | 0.822 | 0.676 |
| 0.198000000000002 | 1.219 | 1.486 | 1.811 | 0.82 | 0.673 |
| 0.200000000000002 | 1.221 | 1.492 | 1.822 | 0.819 | 0.67 |
| 0.202000000000002 | 1.224 | 1.498 | 1.833 | 0.817 | 0.668 |
| 0.204000000000002 | 1.226 | 1.504 | 1.844 | 0.815 | 0.665 |
| 0.206000000000002 | 1.229 | 1.51 | 1.855 | 0.814 | 0.662 |
| 0.208000000000002 | 1.231 | 1.516 | 1.866 | 0.812 | 0.66 |
| 0.210000000000002 | 1.234 | 1.522 | 1.878 | 0.811 | 0.657 |
| 0.212000000000002 | 1.236 | 1.528 | 1.889 | 0.809 | 0.654 |
| 0.214000000000002 | 1.239 | 1.534 | 1.9 | 0.807 | 0.652 |
| 0.216000000000002 | 1.241 | 1.54 | 1.912 | 0.806 | 0.649 |
| 0.218000000000002 | 1.244 | 1.547 | 1.923 | 0.804 | 0.647 |
| 0.220000000000002 | 1.246 | 1.553 | 1.935 | 0.803 | 0.644 |
| 0.222000000000002 | 1.249 | 1.559 | 1.946 | 0.801 | 0.641 |
| 0.224000000000002 | 1.251 | 1.565 | 1.958 | 0.799 | 0.639 |
| 0.226000000000002 | 1.254 | 1.571 | 1.97 | 0.798 | 0.636 |
| 0.228000000000002 | 1.256 | 1.578 | 1.982 | 0.796 | 0.634 |
| 0.230000000000002 | 1.259 | 1.584 | 1.994 | 0.795 | 0.631 |
| 0.232000000000002 | 1.261 | 1.59 | 2.006 | 0.793 | 0.629 |
| 0.234000000000002 | 1.264 | 1.597 | 2.018 | 0.791 | 0.626 |
| 0.236000000000002 | 1.266 | 1.603 | 2.03 | 0.79 | 0.624 |
| 0.238000000000002 | 1.269 | 1.61 | 2.042 | 0.788 | 0.621 |
| 0.240000000000002 | 1.271 | 1.616 | 2.054 | 0.787 | 0.619 |
| 0.242000000000002 | 1.274 | 1.623 | 2.067 | 0.785 | 0.616 |
| 0.244000000000002 | 1.276 | 1.629 | 2.079 | 0.783 | 0.614 |
| 0.246000000000002 | 1.279 | 1.636 | 2.092 | 0.782 | 0.611 |
| 0.248000000000002 | 1.281 | 1.642 | 2.104 | 0.78 | 0.609 |
| 0.250000000000002 | 1.284 | 1.649 | 2.117 | 0.779 | 0.607 |
| 0.252000000000002 | 1.287 | 1.655 | 2.13 | 0.777 | 0.604 |
| 0.254000000000002 | 1.289 | 1.662 | 2.143 | 0.776 | 0.602 |
| 0.256000000000002 | 1.292 | 1.669 | 2.155 | 0.774 | 0.599 |
| 0.258000000000002 | 1.294 | 1.675 | 2.168 | 0.773 | 0.597 |
| 0.260000000000002 | 1.297 | 1.682 | 2.181 | 0.771 | 0.595 |
| 0.262000000000002 | 1.3 | 1.689 | 2.195 | 0.77 | 0.592 |
| 0.264000000000002 | 1.302 | 1.696 | 2.208 | 0.768 | 0.59 |
| 0.266000000000002 | 1.305 | 1.702 | 2.221 | 0.766 | 0.587 |
| 0.268000000000002 | 1.307 | 1.709 | 2.234 | 0.765 | 0.585 |
| 0.270000000000002 | 1.31 | 1.716 | 2.248 | 0.763 | 0.583 |
| 0.272000000000002 | 1.313 | 1.723 | 2.261 | 0.762 | 0.58 |
| 0.274000000000002 | 1.315 | 1.73 | 2.275 | 0.76 | 0.578 |
| 0.276000000000002 | 1.318 | 1.737 | 2.289 | 0.759 | 0.576 |
| 0.278000000000002 | 1.32 | 1.744 | 2.303 | 0.757 | 0.573 |
| 0.280000000000002 | 1.323 | 1.751 | 2.316 | 0.756 | 0.571 |
| 0.282000000000002 | 1.326 | 1.758 | 2.33 | 0.754 | 0.569 |
| 0.284000000000002 | 1.328 | 1.765 | 2.344 | 0.753 | 0.567 |
| 0.286000000000002 | 1.331 | 1.772 | 2.358 | 0.751 | 0.564 |
| 0.288000000000002 | 1.334 | 1.779 | 2.373 | 0.75 | 0.562 |
| 0.290000000000002 | 1.336 | 1.786 | 2.387 | 0.748 | 0.56 |
| 0.292000000000002 | 1.339 | 1.793 | 2.401 | 0.747 | 0.558 |
| 0.294000000000002 | 1.342 | 1.8 | 2.416 | 0.745 | 0.555 |
| 0.296000000000002 | 1.344 | 1.808 | 2.43 | 0.744 | 0.553 |
| 0.298000000000002 | 1.347 | 1.815 | 2.445 | 0.742 | 0.551 |
| 0.300000000000002 | 1.35 | 1.822 | 2.46 | 0.741 | 0.549 |
| 0.302000000000002 | 1.353 | 1.829 | 2.474 | 0.739 | 0.547 |
| 0.304000000000002 | 1.355 | 1.837 | 2.489 | 0.738 | 0.544 |
| 0.306000000000002 | 1.358 | 1.844 | 2.504 | 0.736 | 0.542 |
| 0.308000000000002 | 1.361 | 1.852 | 2.519 | 0.735 | 0.54 |
| 0.310000000000002 | 1.363 | 1.859 | 2.535 | 0.733 | 0.538 |
| 0.312000000000002 | 1.366 | 1.866 | 2.55 | 0.732 | 0.536 |
| 0.314000000000002 | 1.369 | 1.874 | 2.565 | 0.731 | 0.534 |
| 0.316000000000002 | 1.372 | 1.881 | 2.581 | 0.729 | 0.532 |
| 0.318000000000002 | 1.374 | 1.889 | 2.596 | 0.728 | 0.529 |
| 0.320000000000002 | 1.377 | 1.896 | 2.612 | 0.726 | 0.527 |
| 0.322000000000002 | 1.38 | 1.904 | 2.627 | 0.725 | 0.525 |
| 0.324000000000002 | 1.383 | 1.912 | 2.643 | 0.723 | 0.523 |
| 0.326000000000002 | 1.385 | 1.919 | 2.659 | 0.722 | 0.521 |
| 0.328000000000002 | 1.388 | 1.927 | 2.675 | 0.72 | 0.519 |
| 0.330000000000002 | 1.391 | 1.935 | 2.691 | 0.719 | 0.517 |
| 0.332000000000002 | 1.394 | 1.943 | 2.707 | 0.717 | 0.515 |
| 0.334000000000002 | 1.397 | 1.95 | 2.724 | 0.716 | 0.513 |
| 0.336000000000002 | 1.399 | 1.958 | 2.74 | 0.715 | 0.511 |
| 0.338000000000002 | 1.402 | 1.966 | 2.757 | 0.713 | 0.509 |
| 0.340000000000002 | 1.405 | 1.974 | 2.773 | 0.712 | 0.507 |
| 0.342000000000002 | 1.408 | 1.982 | 2.79 | 0.71 | 0.505 |
| 0.344000000000002 | 1.411 | 1.99 | 2.807 | 0.709 | 0.503 |
| 0.346000000000002 | 1.413 | 1.998 | 2.824 | 0.708 | 0.501 |
| 0.348000000000002 | 1.416 | 2.006 | 2.841 | 0.706 | 0.499 |
| 0.350000000000002 | 1.419 | 2.014 | 2.858 | 0.705 | 0.497 |
| 0.352000000000002 | 1.422 | 2.022 | 2.875 | 0.703 | 0.495 |
| 0.354000000000002 | 1.425 | 2.03 | 2.892 | 0.702 | 0.493 |
| 0.356000000000002 | 1.428 | 2.038 | 2.91 | 0.7 | 0.491 |
| 0.358000000000002 | 1.43 | 2.046 | 2.927 | 0.699 | 0.489 |
| 0.360000000000002 | 1.433 | 2.054 | 2.945 | 0.698 | 0.487 |
| 0.362000000000002 | 1.436 | 2.063 | 2.962 | 0.696 | 0.485 |
| 0.364000000000002 | 1.439 | 2.071 | 2.98 | 0.695 | 0.483 |
| 0.366000000000002 | 1.442 | 2.079 | 2.998 | 0.694 | 0.481 |
| 0.368000000000002 | 1.445 | 2.088 | 3.016 | 0.692 | 0.479 |
| 0.370000000000002 | 1.448 | 2.096 | 3.034 | 0.691 | 0.477 |
| 0.372000000000002 | 1.451 | 2.104 | 3.053 | 0.689 | 0.475 |
| 0.374000000000002 | 1.454 | 2.113 | 3.071 | 0.688 | 0.473 |
| 0.376000000000002 | 1.456 | 2.121 | 3.089 | 0.687 | 0.471 |
| 0.378000000000002 | 1.459 | 2.13 | 3.108 | 0.685 | 0.47 |
| 0.380000000000002 | 1.462 | 2.138 | 3.127 | 0.684 | 0.468 |
| 0.382000000000002 | 1.465 | 2.147 | 3.146 | 0.682 | 0.466 |
| 0.384000000000002 | 1.468 | 2.155 | 3.165 | 0.681 | 0.464 |
| 0.386000000000002 | 1.471 | 2.164 | 3.184 | 0.68 | 0.462 |
| 0.388000000000002 | 1.474 | 2.173 | 3.203 | 0.678 | 0.46 |
| 0.390000000000002 | 1.477 | 2.181 | 3.222 | 0.677 | 0.458 |
| 0.392000000000002 | 1.48 | 2.19 | 3.241 | 0.676 | 0.457 |
| 0.394000000000002 | 1.483 | 2.199 | 3.261 | 0.674 | 0.455 |
| 0.396000000000002 | 1.486 | 2.208 | 3.281 | 0.673 | 0.453 |
| 0.398000000000002 | 1.489 | 2.217 | 3.3 | 0.672 | 0.451 |
| 0.400000000000002 | 1.492 | 2.226 | 3.32 | 0.67 | 0.449 |
| 0.402000000000002 | 1.495 | 2.234 | 3.34 | 0.669 | 0.448 |
| 0.404000000000002 | 1.498 | 2.243 | 3.36 | 0.668 | 0.446 |
| 0.406000000000002 | 1.501 | 2.252 | 3.38 | 0.666 | 0.444 |
| 0.408000000000002 | 1.504 | 2.261 | 3.401 | 0.665 | 0.442 |
| 0.410000000000002 | 1.507 | 2.27 | 3.421 | 0.664 | 0.44 |
| 0.412000000000002 | 1.51 | 2.28 | 3.442 | 0.662 | 0.439 |
| 0.414000000000002 | 1.513 | 2.289 | 3.463 | 0.661 | 0.437 |
| 0.416000000000002 | 1.516 | 2.298 | 3.483 | 0.66 | 0.435 |
| 0.418000000000002 | 1.519 | 2.307 | 3.504 | 0.658 | 0.433 |
| 0.420000000000002 | 1.522 | 2.316 | 3.525 | 0.657 | 0.432 |
| 0.422000000000002 | 1.525 | 2.326 | 3.547 | 0.656 | 0.43 |
| 0.424000000000002 | 1.528 | 2.335 | 3.568 | 0.654 | 0.428 |
| 0.426000000000002 | 1.531 | 2.344 | 3.589 | 0.653 | 0.427 |
| 0.428000000000002 | 1.534 | 2.354 | 3.611 | 0.652 | 0.425 |
| 0.430000000000002 | 1.537 | 2.363 | 3.633 | 0.651 | 0.423 |
| 0.432000000000002 | 1.54 | 2.373 | 3.655 | 0.649 | 0.421 |
| 0.434000000000002 | 1.543 | 2.382 | 3.677 | 0.648 | 0.42 |
| 0.436000000000002 | 1.547 | 2.392 | 3.699 | 0.647 | 0.418 |
| 0.438000000000002 | 1.55 | 2.401 | 3.721 | 0.645 | 0.416 |
| 0.440000000000002 | 1.553 | 2.411 | 3.743 | 0.644 | 0.415 |
| 0.442000000000002 | 1.556 | 2.421 | 3.766 | 0.643 | 0.413 |
| 0.444000000000002 | 1.559 | 2.43 | 3.789 | 0.641 | 0.411 |
| 0.446000000000002 | 1.562 | 2.44 | 3.811 | 0.64 | 0.41 |
| 0.448000000000002 | 1.565 | 2.45 | 3.834 | 0.639 | 0.408 |
| 0.450000000000002 | 1.568 | 2.46 | 3.857 | 0.638 | 0.407 |
| 0.452000000000002 | 1.571 | 2.469 | 3.881 | 0.636 | 0.405 |
| 0.454000000000002 | 1.575 | 2.479 | 3.904 | 0.635 | 0.403 |
| 0.456000000000002 | 1.578 | 2.489 | 3.927 | 0.634 | 0.402 |
| 0.458000000000002 | 1.581 | 2.499 | 3.951 | 0.633 | 0.4 |
| 0.460000000000002 | 1.584 | 2.509 | 3.975 | 0.631 | 0.399 |
| 0.462000000000002 | 1.587 | 2.519 | 3.999 | 0.63 | 0.397 |
| 0.464000000000002 | 1.59 | 2.529 | 4.023 | 0.629 | 0.395 |
| 0.466000000000002 | 1.594 | 2.54 | 4.047 | 0.628 | 0.394 |
| 0.468000000000002 | 1.597 | 2.55 | 4.071 | 0.626 | 0.392 |
| 0.470000000000002 | 1.6 | 2.56 | 4.096 | 0.625 | 0.391 |
| 0.472000000000002 | 1.603 | 2.57 | 4.121 | 0.624 | 0.389 |
| 0.474000000000002 | 1.606 | 2.581 | 4.145 | 0.623 | 0.388 |
| 0.476000000000002 | 1.61 | 2.591 | 4.17 | 0.621 | 0.386 |
| 0.478000000000002 | 1.613 | 2.601 | 4.195 | 0.62 | 0.384 |
| 0.480000000000002 | 1.616 | 2.612 | 4.221 | 0.619 | 0.383 |
| 0.482000000000002 | 1.619 | 2.622 | 4.246 | 0.618 | 0.381 |
| 0.484000000000002 | 1.623 | 2.633 | 4.272 | 0.616 | 0.38 |
| 0.486000000000002 | 1.626 | 2.643 | 4.297 | 0.615 | 0.378 |
| 0.488000000000002 | 1.629 | 2.654 | 4.323 | 0.614 | 0.377 |
| 0.490000000000002 | 1.632 | 2.664 | 4.349 | 0.613 | 0.375 |
| 0.492000000000002 | 1.636 | 2.675 | 4.375 | 0.611 | 0.374 |
| 0.494000000000002 | 1.639 | 2.686 | 4.402 | 0.61 | 0.372 |
| 0.496000000000002 | 1.642 | 2.697 | 4.428 | 0.609 | 0.371 |
| 0.498000000000002 | 1.645 | 2.707 | 4.455 | 0.608 | 0.369 |
| 0.500000000000002 | 1.649 | 2.718 | 4.482 | 0.607 | 0.368 |
| 0.502000000000002 | 1.652 | 2.729 | 4.509 | 0.605 | 0.366 |
| 0.504000000000002 | 1.655 | 2.74 | 4.536 | 0.604 | 0.365 |
| 0.506000000000002 | 1.659 | 2.751 | 4.563 | 0.603 | 0.363 |
| 0.508000000000002 | 1.662 | 2.762 | 4.591 | 0.602 | 0.362 |
| 0.510000000000002 | 1.665 | 2.773 | 4.618 | 0.6 | 0.361 |
| 0.512000000000002 | 1.669 | 2.784 | 4.646 | 0.599 | 0.359 |
| 0.514000000000002 | 1.672 | 2.795 | 4.674 | 0.598 | 0.358 |
| 0.516000000000002 | 1.675 | 2.807 | 4.702 | 0.597 | 0.356 |
| 0.518000000000002 | 1.679 | 2.818 | 4.73 | 0.596 | 0.355 |
| 0.520000000000002 | 1.682 | 2.829 | 4.759 | 0.595 | 0.353 |
| 0.522000000000002 | 1.685 | 2.841 | 4.787 | 0.593 | 0.352 |
| 0.524000000000002 | 1.689 | 2.852 | 4.816 | 0.592 | 0.351 |
| 0.526000000000002 | 1.692 | 2.863 | 4.845 | 0.591 | 0.349 |
| 0.528000000000002 | 1.696 | 2.875 | 4.874 | 0.59 | 0.348 |
| 0.530000000000002 | 1.699 | 2.886 | 4.904 | 0.589 | 0.346 |
| 0.532000000000002 | 1.702 | 2.898 | 4.933 | 0.587 | 0.345 |
| 0.534000000000002 | 1.706 | 2.91 | 4.963 | 0.586 | 0.344 |
| 0.536000000000002 | 1.709 | 2.921 | 4.993 | 0.585 | 0.342 |
| 0.538000000000002 | 1.713 | 2.933 | 5.023 | 0.584 | 0.341 |
| 0.540000000000002 | 1.716 | 2.945 | 5.053 | 0.583 | 0.34 |
| 0.542000000000002 | 1.719 | 2.956 | 5.083 | 0.582 | 0.338 |
| 0.544000000000002 | 1.723 | 2.968 | 5.114 | 0.58 | 0.337 |
| 0.546000000000002 | 1.726 | 2.98 | 5.145 | 0.579 | 0.336 |
| 0.548000000000002 | 1.73 | 2.992 | 5.176 | 0.578 | 0.334 |
| 0.550000000000002 | 1.733 | 3.004 | 5.207 | 0.577 | 0.333 |
| 0.552000000000002 | 1.737 | 3.016 | 5.238 | 0.576 | 0.332 |
| 0.554000000000002 | 1.74 | 3.028 | 5.27 | 0.575 | 0.33 |
| 0.556000000000002 | 1.744 | 3.04 | 5.302 | 0.573 | 0.329 |
| 0.558000000000002 | 1.747 | 3.053 | 5.333 | 0.572 | 0.328 |
| 0.560000000000002 | 1.751 | 3.065 | 5.366 | 0.571 | 0.326 |
| 0.562000000000002 | 1.754 | 3.077 | 5.398 | 0.57 | 0.325 |
| 0.564000000000002 | 1.758 | 3.089 | 5.43 | 0.569 | 0.324 |
| 0.566000000000002 | 1.761 | 3.102 | 5.463 | 0.568 | 0.322 |
| 0.568000000000002 | 1.765 | 3.114 | 5.496 | 0.567 | 0.321 |
| 0.570000000000002 | 1.768 | 3.127 | 5.529 | 0.566 | 0.32 |
| 0.572000000000002 | 1.772 | 3.139 | 5.562 | 0.564 | 0.319 |
| 0.574000000000002 | 1.775 | 3.152 | 5.596 | 0.563 | 0.317 |
| 0.576000000000002 | 1.779 | 3.165 | 5.629 | 0.562 | 0.316 |
| 0.578000000000002 | 1.782 | 3.177 | 5.663 | 0.561 | 0.315 |
| 0.580000000000002 | 1.786 | 3.19 | 5.697 | 0.56 | 0.313 |
| 0.582000000000002 | 1.79 | 3.203 | 5.732 | 0.559 | 0.312 |
| 0.584000000000002 | 1.793 | 3.216 | 5.766 | 0.558 | 0.311 |
| 0.586000000000002 | 1.797 | 3.228 | 5.801 | 0.557 | 0.31 |
| 0.588000000000002 | 1.8 | 3.241 | 5.836 | 0.555 | 0.309 |
| 0.590000000000002 | 1.804 | 3.254 | 5.871 | 0.554 | 0.307 |
| 0.592000000000002 | 1.808 | 3.267 | 5.906 | 0.553 | 0.306 |
| 0.594000000000002 | 1.811 | 3.281 | 5.942 | 0.552 | 0.305 |
| 0.596000000000002 | 1.815 | 3.294 | 5.977 | 0.551 | 0.304 |
| 0.598000000000002 | 1.818 | 3.307 | 6.013 | 0.55 | 0.302 |
| 0.600000000000002 | 1.822 | 3.32 | 6.05 | 0.549 | 0.301 |
| 0.602000000000002 | 1.826 | 3.333 | 6.086 | 0.548 | 0.3 |
| 0.604000000000002 | 1.829 | 3.347 | 6.123 | 0.547 | 0.299 |
| 0.606000000000002 | 1.833 | 3.36 | 6.16 | 0.546 | 0.298 |
| 0.608000000000002 | 1.837 | 3.374 | 6.197 | 0.544 | 0.296 |
| 0.610000000000002 | 1.84 | 3.387 | 6.234 | 0.543 | 0.295 |
| 0.612000000000002 | 1.844 | 3.401 | 6.271 | 0.542 | 0.294 |
| 0.614000000000002 | 1.848 | 3.414 | 6.309 | 0.541 | 0.293 |
| 0.616000000000002 | 1.852 | 3.428 | 6.347 | 0.54 | 0.292 |
| 0.618000000000002 | 1.855 | 3.442 | 6.385 | 0.539 | 0.291 |
| 0.620000000000002 | 1.859 | 3.456 | 6.424 | 0.538 | 0.289 |
| 0.622000000000002 | 1.863 | 3.469 | 6.462 | 0.537 | 0.288 |
| 0.624000000000002 | 1.866 | 3.483 | 6.501 | 0.536 | 0.287 |
| 0.626000000000002 | 1.87 | 3.497 | 6.54 | 0.535 | 0.286 |
| 0.628000000000002 | 1.874 | 3.511 | 6.58 | 0.534 | 0.285 |
| 0.630000000000002 | 1.878 | 3.525 | 6.619 | 0.533 | 0.284 |
| 0.632000000000002 | 1.881 | 3.54 | 6.659 | 0.532 | 0.283 |
| 0.634000000000002 | 1.885 | 3.554 | 6.699 | 0.53 | 0.281 |
| 0.636000000000002 | 1.889 | 3.568 | 6.74 | 0.529 | 0.28 |
| 0.638000000000002 | 1.893 | 3.582 | 6.78 | 0.528 | 0.279 |
| 0.640000000000002 | 1.896 | 3.597 | 6.821 | 0.527 | 0.278 |
| 0.642000000000002 | 1.9 | 3.611 | 6.862 | 0.526 | 0.277 |
| 0.644000000000002 | 1.904 | 3.626 | 6.903 | 0.525 | 0.276 |
| 0.646000000000002 | 1.908 | 3.64 | 6.945 | 0.524 | 0.275 |
| 0.648000000000002 | 1.912 | 3.655 | 6.987 | 0.523 | 0.274 |
| 0.650000000000002 | 1.916 | 3.669 | 7.029 | 0.522 | 0.273 |
| 0.652000000000002 | 1.919 | 3.684 | 7.071 | 0.521 | 0.271 |
| 0.654000000000002 | 1.923 | 3.699 | 7.114 | 0.52 | 0.27 |
| 0.656000000000002 | 1.927 | 3.714 | 7.156 | 0.519 | 0.269 |
| 0.658000000000002 | 1.931 | 3.728 | 7.199 | 0.518 | 0.268 |
| 0.660000000000002 | 1.935 | 3.743 | 7.243 | 0.517 | 0.267 |
| 0.662000000000002 | 1.939 | 3.758 | 7.286 | 0.516 | 0.266 |
| 0.664000000000002 | 1.943 | 3.773 | 7.33 | 0.515 | 0.265 |
| 0.666000000000002 | 1.946 | 3.789 | 7.374 | 0.514 | 0.264 |
| 0.668000000000002 | 1.95 | 3.804 | 7.419 | 0.513 | 0.263 |
| 0.670000000000002 | 1.954 | 3.819 | 7.463 | 0.512 | 0.262 |
| 0.672000000000002 | 1.958 | 3.834 | 7.508 | 0.511 | 0.261 |
| 0.674000000000002 | 1.962 | 3.85 | 7.553 | 0.51 | 0.26 |
| 0.676000000000002 | 1.966 | 3.865 | 7.599 | 0.509 | 0.259 |
| 0.678000000000002 | 1.97 | 3.881 | 7.645 | 0.508 | 0.258 |
| 0.680000000000002 | 1.974 | 3.896 | 7.691 | 0.507 | 0.257 |
| 0.682000000000002 | 1.978 | 3.912 | 7.737 | 0.506 | 0.256 |
| 0.684000000000002 | 1.982 | 3.927 | 7.783 | 0.505 | 0.255 |
| 0.686000000000002 | 1.986 | 3.943 | 7.83 | 0.504 | 0.254 |
| 0.688000000000002 | 1.99 | 3.959 | 7.877 | 0.503 | 0.253 |
| 0.690000000000002 | 1.994 | 3.975 | 7.925 | 0.502 | 0.252 |
| 0.692000000000002 | 1.998 | 3.991 | 7.973 | 0.501 | 0.251 |
| 0.694000000000002 | 2.002 | 4.007 | 8.02 | 0.5 | 0.25 |
| 0.696000000000002 | 2.006 | 4.023 | 8.069 | 0.499 | 0.249 |
| 0.698000000000002 | 2.01 | 4.039 | 8.117 | 0.498 | 0.248 |
| 0.700000000000002 | 2.014 | 4.055 | 8.166 | 0.497 | 0.247 |
| 0.702000000000002 | 2.018 | 4.071 | 8.215 | 0.496 | 0.246 |
| 0.704000000000002 | 2.022 | 4.088 | 8.265 | 0.495 | 0.245 |
| 0.706000000000002 | 2.026 | 4.104 | 8.314 | 0.494 | 0.244 |
| 0.708000000000002 | 2.03 | 4.121 | 8.365 | 0.493 | 0.243 |
| 0.710000000000002 | 2.034 | 4.137 | 8.415 | 0.492 | 0.242 |
| 0.712000000000002 | 2.038 | 4.154 | 8.466 | 0.491 | 0.241 |
| 0.714000000000002 | 2.042 | 4.17 | 8.516 | 0.49 | 0.24 |
| 0.716000000000002 | 2.046 | 4.187 | 8.568 | 0.489 | 0.239 |
| 0.718000000000002 | 2.05 | 4.204 | 8.619 | 0.488 | 0.238 |
| 0.720000000000002 | 2.054 | 4.221 | 8.671 | 0.487 | 0.237 |
| 0.722000000000002 | 2.059 | 4.238 | 8.723 | 0.486 | 0.236 |
| 0.724000000000002 | 2.063 | 4.255 | 8.776 | 0.485 | 0.235 |
| 0.726000000000002 | 2.067 | 4.272 | 8.829 | 0.484 | 0.234 |
| 0.728000000000002 | 2.071 | 4.289 | 8.882 | 0.483 | 0.233 |
| 0.730000000000002 | 2.075 | 4.306 | 8.935 | 0.482 | 0.232 |
| 0.732000000000002 | 2.079 | 4.323 | 8.989 | 0.481 | 0.231 |
| 0.734000000000002 | 2.083 | 4.341 | 9.043 | 0.48 | 0.23 |
| 0.736000000000002 | 2.088 | 4.358 | 9.098 | 0.479 | 0.229 |
| 0.738000000000002 | 2.092 | 4.375 | 9.152 | 0.478 | 0.229 |
| 0.740000000000002 | 2.096 | 4.393 | 9.207 | 0.477 | 0.228 |
| 0.742000000000002 | 2.1 | 4.411 | 9.263 | 0.476 | 0.227 |
| 0.744000000000002 | 2.104 | 4.428 | 9.318 | 0.475 | 0.226 |
| 0.746000000000002 | 2.109 | 4.446 | 9.375 | 0.474 | 0.225 |
| 0.748000000000002 | 2.113 | 4.464 | 9.431 | 0.473 | 0.224 |
| 0.750000000000002 | 2.117 | 4.482 | 9.488 | 0.472 | 0.223 |
| 0.752000000000002 | 2.121 | 4.5 | 9.545 | 0.471 | 0.222 |
| 0.754000000000002 | 2.125 | 4.518 | 9.602 | 0.47 | 0.221 |
| 0.756000000000002 | 2.13 | 4.536 | 9.66 | 0.47 | 0.22 |
| 0.758000000000002 | 2.134 | 4.554 | 9.718 | 0.469 | 0.22 |
| 0.760000000000002 | 2.138 | 4.572 | 9.777 | 0.468 | 0.219 |
| 0.762000000000002 | 2.143 | 4.591 | 9.836 | 0.467 | 0.218 |
| 0.764000000000002 | 2.147 | 4.609 | 9.895 | 0.466 | 0.217 |
| 0.766000000000002 | 2.151 | 4.627 | 9.954 | 0.465 | 0.216 |
| 0.768000000000002 | 2.155 | 4.646 | 10.014 | 0.464 | 0.215 |
| 0.770000000000002 | 2.16 | 4.665 | 10.074 | 0.463 | 0.214 |
| 0.772000000000002 | 2.164 | 4.683 | 10.135 | 0.462 | 0.214 |
| 0.774000000000002 | 2.168 | 4.702 | 10.196 | 0.461 | 0.213 |
| 0.776000000000002 | 2.173 | 4.721 | 10.257 | 0.46 | 0.212 |
| 0.778000000000002 | 2.177 | 4.74 | 10.319 | 0.459 | 0.211 |
| 0.780000000000002 | 2.181 | 4.759 | 10.381 | 0.458 | 0.21 |
| 0.782000000000002 | 2.186 | 4.778 | 10.444 | 0.457 | 0.209 |
| 0.784000000000002 | 2.19 | 4.797 | 10.507 | 0.457 | 0.208 |
| 0.786000000000002 | 2.195 | 4.816 | 10.57 | 0.456 | 0.208 |
| 0.788000000000002 | 2.199 | 4.836 | 10.633 | 0.455 | 0.207 |
| 0.790000000000002 | 2.203 | 4.855 | 10.697 | 0.454 | 0.206 |
| 0.792000000000002 | 2.208 | 4.874 | 10.762 | 0.453 | 0.205 |
| 0.794000000000002 | 2.212 | 4.894 | 10.827 | 0.452 | 0.204 |
| 0.796000000000002 | 2.217 | 4.914 | 10.892 | 0.451 | 0.204 |
| 0.798000000000002 | 2.221 | 4.933 | 10.957 | 0.45 | 0.203 |
| 0.800000000000002 | 2.226 | 4.953 | 11.023 | 0.449 | 0.202 |
| 0.802000000000002 | 2.23 | 4.973 | 11.09 | 0.448 | 0.201 |
| 0.804000000000002 | 2.234 | 4.993 | 11.156 | 0.448 | 0.2 |
| 0.806000000000002 | 2.239 | 5.013 | 11.223 | 0.447 | 0.199 |
| 0.808000000000002 | 2.243 | 5.033 | 11.291 | 0.446 | 0.199 |
| 0.810000000000002 | 2.248 | 5.053 | 11.359 | 0.445 | 0.198 |
| 0.812000000000002 | 2.252 | 5.073 | 11.427 | 0.444 | 0.197 |
| 0.814000000000002 | 2.257 | 5.094 | 11.496 | 0.443 | 0.196 |
| 0.816000000000002 | 2.261 | 5.114 | 11.565 | 0.442 | 0.196 |
| 0.818000000000002 | 2.266 | 5.135 | 11.635 | 0.441 | 0.195 |
| 0.820000000000002 | 2.27 | 5.155 | 11.705 | 0.44 | 0.194 |
| 0.822000000000002 | 2.275 | 5.176 | 11.775 | 0.44 | 0.193 |
| 0.824000000000002 | 2.28 | 5.197 | 11.846 | 0.439 | 0.192 |
| 0.826000000000002 | 2.284 | 5.217 | 11.917 | 0.438 | 0.192 |
| 0.828000000000002 | 2.289 | 5.238 | 11.989 | 0.437 | 0.191 |
| 0.830000000000002 | 2.293 | 5.259 | 12.061 | 0.436 | 0.19 |
| 0.832000000000002 | 2.298 | 5.28 | 12.134 | 0.435 | 0.189 |
| 0.834000000000002 | 2.303 | 5.302 | 12.207 | 0.434 | 0.189 |
| 0.836000000000002 | 2.307 | 5.323 | 12.28 | 0.433 | 0.188 |
| 0.838000000000002 | 2.312 | 5.344 | 12.354 | 0.433 | 0.187 |
| 0.840000000000002 | 2.316 | 5.366 | 12.429 | 0.432 | 0.186 |
| 0.842000000000002 | 2.321 | 5.387 | 12.503 | 0.431 | 0.186 |
| 0.844000000000002 | 2.326 | 5.409 | 12.579 | 0.43 | 0.185 |
| 0.846000000000002 | 2.33 | 5.43 | 12.654 | 0.429 | 0.184 |
| 0.848000000000002 | 2.335 | 5.452 | 12.73 | 0.428 | 0.183 |
| 0.850000000000002 | 2.34 | 5.474 | 12.807 | 0.427 | 0.183 |
| 0.852000000000002 | 2.344 | 5.496 | 12.884 | 0.427 | 0.182 |
| 0.854000000000002 | 2.349 | 5.518 | 12.962 | 0.426 | 0.181 |
| 0.856000000000002 | 2.354 | 5.54 | 13.04 | 0.425 | 0.181 |
| 0.858000000000002 | 2.358 | 5.562 | 13.118 | 0.424 | 0.18 |
| 0.860000000000002 | 2.363 | 5.585 | 13.197 | 0.423 | 0.179 |
| 0.862000000000002 | 2.368 | 5.607 | 13.277 | 0.422 | 0.178 |
| 0.864000000000002 | 2.373 | 5.629 | 13.356 | 0.421 | 0.178 |
| 0.866000000000002 | 2.377 | 5.652 | 13.437 | 0.421 | 0.177 |
| 0.868000000000002 | 2.382 | 5.675 | 13.518 | 0.42 | 0.176 |
| 0.870000000000002 | 2.387 | 5.697 | 13.599 | 0.419 | 0.176 |
| 0.872000000000002 | 2.392 | 5.72 | 13.681 | 0.418 | 0.175 |
| 0.874000000000002 | 2.396 | 5.743 | 13.763 | 0.417 | 0.174 |
| 0.876000000000002 | 2.401 | 5.766 | 13.846 | 0.416 | 0.173 |
| 0.878000000000002 | 2.406 | 5.789 | 13.929 | 0.416 | 0.173 |
| 0.880000000000002 | 2.411 | 5.812 | 14.013 | 0.415 | 0.172 |
| 0.882000000000002 | 2.416 | 5.836 | 14.098 | 0.414 | 0.171 |
| 0.884000000000002 | 2.421 | 5.859 | 14.182 | 0.413 | 0.171 |
| 0.886000000000002 | 2.425 | 5.883 | 14.268 | 0.412 | 0.17 |
| 0.888000000000002 | 2.43 | 5.906 | 14.354 | 0.411 | 0.169 |
| 0.890000000000002 | 2.435 | 5.93 | 14.44 | 0.411 | 0.169 |
| 0.892000000000002 | 2.44 | 5.954 | 14.527 | 0.41 | 0.168 |
| 0.894000000000002 | 2.445 | 5.977 | 14.614 | 0.409 | 0.167 |
| 0.896000000000002 | 2.45 | 6.001 | 14.702 | 0.408 | 0.167 |
| 0.898000000000002 | 2.455 | 6.025 | 14.791 | 0.407 | 0.166 |
| 0.900000000000002 | 2.46 | 6.05 | 14.88 | 0.407 | 0.165 |
| 0.902000000000002 | 2.465 | 6.074 | 14.969 | 0.406 | 0.165 |
| 0.904000000000002 | 2.469 | 6.098 | 15.059 | 0.405 | 0.164 |
| 0.906000000000002 | 2.474 | 6.123 | 15.15 | 0.404 | 0.163 |
| 0.908000000000002 | 2.479 | 6.147 | 15.241 | 0.403 | 0.163 |
| 0.910000000000002 | 2.484 | 6.172 | 15.333 | 0.403 | 0.162 |
| 0.912000000000002 | 2.489 | 6.197 | 15.425 | 0.402 | 0.161 |
| 0.914000000000002 | 2.494 | 6.221 | 15.518 | 0.401 | 0.161 |
| 0.916000000000002 | 2.499 | 6.246 | 15.611 | 0.4 | 0.16 |
| 0.918000000000002 | 2.504 | 6.271 | 15.705 | 0.399 | 0.159 |
| 0.920000000000002 | 2.509 | 6.297 | 15.8 | 0.399 | 0.159 |
| 0.922000000000002 | 2.514 | 6.322 | 15.895 | 0.398 | 0.158 |
| 0.924000000000002 | 2.519 | 6.347 | 15.991 | 0.397 | 0.158 |
| 0.926000000000002 | 2.524 | 6.373 | 16.087 | 0.396 | 0.157 |
| 0.928000000000002 | 2.529 | 6.398 | 16.184 | 0.395 | 0.156 |
| 0.930000000000002 | 2.535 | 6.424 | 16.281 | 0.395 | 0.156 |
| 0.932000000000002 | 2.54 | 6.449 | 16.379 | 0.394 | 0.155 |
| 0.934000000000002 | 2.545 | 6.475 | 16.478 | 0.393 | 0.154 |
| 0.936000000000002 | 2.55 | 6.501 | 16.577 | 0.392 | 0.154 |
| 0.938000000000002 | 2.555 | 6.527 | 16.676 | 0.391 | 0.153 |
| 0.940000000000002 | 2.56 | 6.554 | 16.777 | 0.391 | 0.153 |
| 0.942000000000002 | 2.565 | 6.58 | 16.878 | 0.39 | 0.152 |
| 0.944000000000002 | 2.57 | 6.606 | 16.979 | 0.389 | 0.151 |
| 0.946000000000002 | 2.575 | 6.633 | 17.082 | 0.388 | 0.151 |
| 0.948000000000002 | 2.581 | 6.659 | 17.184 | 0.388 | 0.15 |
| 0.950000000000002 | 2.586 | 6.686 | 17.288 | 0.387 | 0.15 |
| 0.952000000000002 | 2.591 | 6.713 | 17.392 | 0.386 | 0.149 |
| 0.954000000000002 | 2.596 | 6.74 | 17.496 | 0.385 | 0.148 |
| 0.956000000000002 | 2.601 | 6.767 | 17.602 | 0.384 | 0.148 |
| 0.958000000000002 | 2.606 | 6.794 | 17.708 | 0.384 | 0.147 |
| 0.960000000000002 | 2.612 | 6.821 | 17.814 | 0.383 | 0.147 |
| 0.962000000000002 | 2.617 | 6.848 | 17.921 | 0.382 | 0.146 |
| 0.964000000000002 | 2.622 | 6.876 | 18.029 | 0.381 | 0.145 |
| 0.966000000000002 | 2.627 | 6.903 | 18.138 | 0.381 | 0.145 |
| 0.968000000000002 | 2.633 | 6.931 | 18.247 | 0.38 | 0.144 |
| 0.970000000000002 | 2.638 | 6.959 | 18.357 | 0.379 | 0.144 |
| 0.972000000000002 | 2.643 | 6.987 | 18.467 | 0.378 | 0.143 |
| 0.974000000000003 | 2.649 | 7.015 | 18.578 | 0.378 | 0.143 |
| 0.976000000000003 | 2.654 | 7.043 | 18.69 | 0.377 | 0.142 |
| 0.978000000000003 | 2.659 | 7.071 | 18.803 | 0.376 | 0.141 |
| 0.980000000000002 | 2.664 | 7.099 | 18.916 | 0.375 | 0.141 |
| 0.982000000000002 | 2.67 | 7.128 | 19.03 | 0.375 | 0.14 |
| 0.984000000000003 | 2.675 | 7.156 | 19.144 | 0.374 | 0.14 |
| 0.986000000000003 | 2.68 | 7.185 | 19.259 | 0.373 | 0.139 |
| 0.988000000000003 | 2.686 | 7.214 | 19.375 | 0.372 | 0.139 |
| 0.990000000000002 | 2.691 | 7.243 | 19.492 | 0.372 | 0.138 |
| 0.992000000000002 | 2.697 | 7.272 | 19.609 | 0.371 | 0.138 |
| 0.994000000000003 | 2.702 | 7.301 | 19.727 | 0.37 | 0.137 |
| 0.996000000000003 | 2.707 | 7.33 | 19.846 | 0.369 | 0.136 |
| 0.998000000000003 | 2.713 | 7.36 | 19.965 | 0.369 | 0.136 |
| 1.000000000000002 | 2.718 | 7.389 | 20.086 | 0.368 | 0.135 |
| 1.002000000000002 | 2.724 | 7.419 | 20.206 | 0.367 | 0.135 |
| 1.004000000000002 | 2.729 | 7.448 | 20.328 | 0.366 | 0.134 |
| 1.006000000000002 | 2.735 | 7.478 | 20.45 | 0.366 | 0.134 |
| 1.008000000000002 | 2.74 | 7.508 | 20.573 | 0.365 | 0.133 |
| 1.010000000000002 | 2.746 | 7.538 | 20.697 | 0.364 | 0.133 |
| 1.012000000000002 | 2.751 | 7.569 | 20.822 | 0.363 | 0.132 |
| 1.014000000000002 | 2.757 | 7.599 | 20.947 | 0.363 | 0.132 |
| 1.016000000000002 | 2.762 | 7.629 | 21.073 | 0.362 | 0.131 |
| 1.018000000000002 | 2.768 | 7.66 | 21.2 | 0.361 | 0.131 |
| 1.020000000000002 | 2.773 | 7.691 | 21.328 | 0.361 | 0.13 |
| 1.022000000000002 | 2.779 | 7.721 | 21.456 | 0.36 | 0.13 |
| 1.024000000000002 | 2.784 | 7.752 | 21.585 | 0.359 | 0.129 |
| 1.026000000000002 | 2.79 | 7.783 | 21.715 | 0.358 | 0.128 |
| 1.028000000000002 | 2.795 | 7.815 | 21.846 | 0.358 | 0.128 |
| 1.030000000000002 | 2.801 | 7.846 | 21.977 | 0.357 | 0.127 |
| 1.032000000000002 | 2.807 | 7.877 | 22.109 | 0.356 | 0.127 |
| 1.034000000000002 | 2.812 | 7.909 | 22.242 | 0.356 | 0.126 |
| 1.036000000000002 | 2.818 | 7.941 | 22.376 | 0.355 | 0.126 |
| 1.038000000000002 | 2.824 | 7.973 | 22.511 | 0.354 | 0.125 |
| 1.040000000000002 | 2.829 | 8.004 | 22.646 | 0.353 | 0.125 |
| 1.042000000000002 | 2.835 | 8.037 | 22.783 | 0.353 | 0.124 |
| 1.044000000000002 | 2.841 | 8.069 | 22.92 | 0.352 | 0.124 |
| 1.046000000000002 | 2.846 | 8.101 | 23.058 | 0.351 | 0.123 |
| 1.048000000000002 | 2.852 | 8.134 | 23.196 | 0.351 | 0.123 |
| 1.050000000000002 | 2.858 | 8.166 | 23.336 | 0.35 | 0.122 |
| 1.052000000000002 | 2.863 | 8.199 | 23.477 | 0.349 | 0.122 |
| 1.054000000000002 | 2.869 | 8.232 | 23.618 | 0.349 | 0.121 |
| 1.056000000000002 | 2.875 | 8.265 | 23.76 | 0.348 | 0.121 |
| 1.058000000000002 | 2.881 | 8.298 | 23.903 | 0.347 | 0.121 |
| 1.060000000000002 | 2.886 | 8.331 | 24.047 | 0.346 | 0.12 |
| 1.062000000000002 | 2.892 | 8.365 | 24.191 | 0.346 | 0.12 |
| 1.064000000000002 | 2.898 | 8.398 | 24.337 | 0.345 | 0.119 |
| 1.066000000000002 | 2.904 | 8.432 | 24.484 | 0.344 | 0.119 |
| 1.068000000000002 | 2.91 | 8.466 | 24.631 | 0.344 | 0.118 |
| 1.070000000000002 | 2.915 | 8.499 | 24.779 | 0.343 | 0.118 |
| 1.072000000000002 | 2.921 | 8.534 | 24.928 | 0.342 | 0.117 |
| 1.074000000000003 | 2.927 | 8.568 | 25.078 | 0.342 | 0.117 |
| 1.076000000000003 | 2.933 | 8.602 | 25.229 | 0.341 | 0.116 |
| 1.078000000000003 | 2.939 | 8.637 | 25.381 | 0.34 | 0.116 |
| 1.080000000000002 | 2.945 | 8.671 | 25.534 | 0.34 | 0.115 |
| 1.082000000000002 | 2.951 | 8.706 | 25.687 | 0.339 | 0.115 |
| 1.084000000000003 | 2.956 | 8.741 | 25.842 | 0.338 | 0.114 |
| 1.086000000000003 | 2.962 | 8.776 | 25.997 | 0.338 | 0.114 |
| 1.088000000000003 | 2.968 | 8.811 | 26.154 | 0.337 | 0.113 |
| 1.090000000000002 | 2.974 | 8.846 | 26.311 | 0.336 | 0.113 |
| 1.092000000000002 | 2.98 | 8.882 | 26.47 | 0.336 | 0.113 |
| 1.094000000000003 | 2.986 | 8.917 | 26.629 | 0.335 | 0.112 |
| 1.096000000000003 | 2.992 | 8.953 | 26.789 | 0.334 | 0.112 |
| 1.098000000000003 | 2.998 | 8.989 | 26.95 | 0.334 | 0.111 |
| 1.100000000000003 | 3.004 | 9.025 | 27.113 | 0.333 | 0.111 |
| 1.102000000000003 | 3.01 | 9.061 | 27.276 | 0.332 | 0.11 |
| 1.104000000000003 | 3.016 | 9.098 | 27.44 | 0.332 | 0.11 |
| 1.106000000000003 | 3.022 | 9.134 | 27.605 | 0.331 | 0.109 |
| 1.108000000000003 | 3.028 | 9.171 | 27.771 | 0.33 | 0.109 |
| 1.110000000000003 | 3.034 | 9.207 | 27.938 | 0.33 | 0.109 |
| 1.112000000000003 | 3.04 | 9.244 | 28.106 | 0.329 | 0.108 |
| 1.114000000000003 | 3.047 | 9.281 | 28.276 | 0.328 | 0.108 |
| 1.116000000000003 | 3.053 | 9.318 | 28.446 | 0.328 | 0.107 |
| 1.118000000000003 | 3.059 | 9.356 | 28.617 | 0.327 | 0.107 |
| 1.120000000000003 | 3.065 | 9.393 | 28.789 | 0.326 | 0.106 |
| 1.122000000000003 | 3.071 | 9.431 | 28.962 | 0.326 | 0.106 |
| 1.124000000000003 | 3.077 | 9.469 | 29.137 | 0.325 | 0.106 |
| 1.126000000000003 | 3.083 | 9.507 | 29.312 | 0.324 | 0.105 |
| 1.128000000000003 | 3.089 | 9.545 | 29.488 | 0.324 | 0.105 |
| 1.130000000000003 | 3.096 | 9.583 | 29.666 | 0.323 | 0.104 |
| 1.132000000000003 | 3.102 | 9.621 | 29.844 | 0.322 | 0.104 |
| 1.134000000000003 | 3.108 | 9.66 | 30.024 | 0.322 | 0.104 |
| 1.136000000000003 | 3.114 | 9.699 | 30.205 | 0.321 | 0.103 |
| 1.138000000000003 | 3.121 | 9.738 | 30.387 | 0.32 | 0.103 |
| 1.140000000000003 | 3.127 | 9.777 | 30.569 | 0.32 | 0.102 |
| 1.142000000000003 | 3.133 | 9.816 | 30.753 | 0.319 | 0.102 |
| 1.144000000000003 | 3.139 | 9.855 | 30.938 | 0.319 | 0.101 |
| 1.146000000000003 | 3.146 | 9.895 | 31.125 | 0.318 | 0.101 |
| 1.148000000000003 | 3.152 | 9.934 | 31.312 | 0.317 | 0.101 |
| 1.150000000000003 | 3.158 | 9.974 | 31.5 | 0.317 | 0.1 |
| 1.152000000000003 | 3.165 | 10.014 | 31.69 | 0.316 | 0.1 |
| 1.154000000000003 | 3.171 | 10.054 | 31.881 | 0.315 | 0.099 |
| 1.156000000000003 | 3.177 | 10.095 | 32.073 | 0.315 | 0.099 |
| 1.158000000000003 | 3.184 | 10.135 | 32.266 | 0.314 | 0.099 |
| 1.160000000000003 | 3.19 | 10.176 | 32.46 | 0.313 | 0.098 |
| 1.162000000000003 | 3.196 | 10.216 | 32.655 | 0.313 | 0.098 |
| 1.164000000000003 | 3.203 | 10.257 | 32.852 | 0.312 | 0.097 |
| 1.166000000000003 | 3.209 | 10.299 | 33.049 | 0.312 | 0.097 |
| 1.168000000000003 | 3.216 | 10.34 | 33.248 | 0.311 | 0.097 |
| 1.170000000000003 | 3.222 | 10.381 | 33.448 | 0.31 | 0.096 |
| 1.172000000000003 | 3.228 | 10.423 | 33.65 | 0.31 | 0.096 |
| 1.174000000000003 | 3.235 | 10.465 | 33.852 | 0.309 | 0.096 |
| 1.176000000000003 | 3.241 | 10.507 | 34.056 | 0.309 | 0.095 |
| 1.178000000000003 | 3.248 | 10.549 | 34.261 | 0.308 | 0.095 |
| 1.180000000000003 | 3.254 | 10.591 | 34.467 | 0.307 | 0.094 |
| 1.182000000000003 | 3.261 | 10.633 | 34.674 | 0.307 | 0.094 |
| 1.184000000000003 | 3.267 | 10.676 | 34.883 | 0.306 | 0.094 |
| 1.186000000000003 | 3.274 | 10.719 | 35.093 | 0.305 | 0.093 |
| 1.188000000000003 | 3.281 | 10.762 | 35.304 | 0.305 | 0.093 |
| 1.190000000000003 | 3.287 | 10.805 | 35.517 | 0.304 | 0.093 |
| 1.192000000000003 | 3.294 | 10.848 | 35.73 | 0.304 | 0.092 |
| 1.194000000000003 | 3.3 | 10.892 | 35.945 | 0.303 | 0.092 |
| 1.196000000000003 | 3.307 | 10.935 | 36.162 | 0.302 | 0.091 |
| 1.198000000000003 | 3.313 | 10.979 | 36.379 | 0.302 | 0.091 |
| 1.200000000000003 | 3.32 | 11.023 | 36.598 | 0.301 | 0.091 |
| 1.202000000000003 | 3.327 | 11.067 | 36.818 | 0.301 | 0.09 |
| 1.204000000000003 | 3.333 | 11.112 | 37.04 | 0.3 | 0.09 |
| 1.206000000000003 | 3.34 | 11.156 | 37.263 | 0.299 | 0.09 |
| 1.208000000000003 | 3.347 | 11.201 | 37.487 | 0.299 | 0.089 |
| 1.210000000000003 | 3.353 | 11.246 | 37.713 | 0.298 | 0.089 |
| 1.212000000000003 | 3.36 | 11.291 | 37.94 | 0.298 | 0.089 |
| 1.214000000000003 | 3.367 | 11.336 | 38.168 | 0.297 | 0.088 |
| 1.216000000000003 | 3.374 | 11.382 | 38.398 | 0.296 | 0.088 |
| 1.218000000000003 | 3.38 | 11.427 | 38.629 | 0.296 | 0.088 |
| 1.220000000000003 | 3.387 | 11.473 | 38.861 | 0.295 | 0.087 |
| 1.222000000000003 | 3.394 | 11.519 | 39.095 | 0.295 | 0.087 |
| 1.224000000000003 | 3.401 | 11.565 | 39.33 | 0.294 | 0.086 |
| 1.226000000000003 | 3.408 | 11.612 | 39.567 | 0.293 | 0.086 |
| 1.228000000000003 | 3.414 | 11.658 | 39.805 | 0.293 | 0.086 |
| 1.230000000000003 | 3.421 | 11.705 | 40.045 | 0.292 | 0.085 |
| 1.232000000000003 | 3.428 | 11.752 | 40.286 | 0.292 | 0.085 |
| 1.234000000000003 | 3.435 | 11.799 | 40.528 | 0.291 | 0.085 |
| 1.236000000000003 | 3.442 | 11.846 | 40.772 | 0.291 | 0.084 |
| 1.238000000000003 | 3.449 | 11.894 | 41.018 | 0.29 | 0.084 |
| 1.240000000000003 | 3.456 | 11.941 | 41.264 | 0.289 | 0.084 |
| 1.242000000000003 | 3.463 | 11.989 | 41.513 | 0.289 | 0.083 |
| 1.244000000000003 | 3.469 | 12.037 | 41.763 | 0.288 | 0.083 |
| 1.246000000000003 | 3.476 | 12.085 | 42.014 | 0.288 | 0.083 |
| 1.248000000000003 | 3.483 | 12.134 | 42.267 | 0.287 | 0.082 |
| 1.250000000000003 | 3.49 | 12.182 | 42.521 | 0.287 | 0.082 |
| 1.252000000000003 | 3.497 | 12.231 | 42.777 | 0.286 | 0.082 |
| 1.254000000000003 | 3.504 | 12.28 | 43.034 | 0.285 | 0.081 |
| 1.256000000000003 | 3.511 | 12.33 | 43.293 | 0.285 | 0.081 |
| 1.258000000000003 | 3.518 | 12.379 | 43.554 | 0.284 | 0.081 |
| 1.260000000000003 | 3.525 | 12.429 | 43.816 | 0.284 | 0.08 |
| 1.262000000000003 | 3.532 | 12.478 | 44.08 | 0.283 | 0.08 |
| 1.264000000000003 | 3.54 | 12.528 | 44.345 | 0.283 | 0.08 |
| 1.266000000000003 | 3.547 | 12.579 | 44.612 | 0.282 | 0.079 |
| 1.268000000000003 | 3.554 | 12.629 | 44.88 | 0.281 | 0.079 |
| 1.270000000000003 | 3.561 | 12.68 | 45.15 | 0.281 | 0.079 |
| 1.272000000000003 | 3.568 | 12.73 | 45.422 | 0.28 | 0.079 |
| 1.274000000000003 | 3.575 | 12.782 | 45.696 | 0.28 | 0.078 |
| 1.276000000000003 | 3.582 | 12.833 | 45.971 | 0.279 | 0.078 |
| 1.278000000000003 | 3.589 | 12.884 | 46.247 | 0.279 | 0.078 |
| 1.280000000000003 | 3.597 | 12.936 | 46.525 | 0.278 | 0.077 |
| 1.282000000000003 | 3.604 | 12.988 | 46.805 | 0.277 | 0.077 |
| 1.284000000000003 | 3.611 | 13.04 | 47.087 | 0.277 | 0.077 |
| 1.286000000000003 | 3.618 | 13.092 | 47.371 | 0.276 | 0.076 |
| 1.288000000000003 | 3.626 | 13.144 | 47.656 | 0.276 | 0.076 |
| 1.290000000000003 | 3.633 | 13.197 | 47.942 | 0.275 | 0.076 |
| 1.292000000000003 | 3.64 | 13.25 | 48.231 | 0.275 | 0.075 |
| 1.294000000000003 | 3.647 | 13.303 | 48.521 | 0.274 | 0.075 |
| 1.296000000000003 | 3.655 | 13.356 | 48.813 | 0.274 | 0.075 |
| 1.298000000000003 | 3.662 | 13.41 | 49.107 | 0.273 | 0.075 |
| 1.300000000000003 | 3.669 | 13.464 | 49.402 | 0.273 | 0.074 |
| 1.302000000000003 | 3.677 | 13.518 | 49.7 | 0.272 | 0.074 |
| 1.304000000000003 | 3.684 | 13.572 | 49.999 | 0.271 | 0.074 |
| 1.306000000000003 | 3.691 | 13.626 | 50.3 | 0.271 | 0.073 |
| 1.308000000000003 | 3.699 | 13.681 | 50.602 | 0.27 | 0.073 |
| 1.310000000000003 | 3.706 | 13.736 | 50.907 | 0.27 | 0.073 |
| 1.312000000000003 | 3.714 | 13.791 | 51.213 | 0.269 | 0.073 |
| 1.314000000000003 | 3.721 | 13.846 | 51.522 | 0.269 | 0.072 |
| 1.316000000000003 | 3.728 | 13.902 | 51.832 | 0.268 | 0.072 |
| 1.318000000000003 | 3.736 | 13.957 | 52.144 | 0.268 | 0.072 |
| 1.320000000000003 | 3.743 | 14.013 | 52.457 | 0.267 | 0.071 |
| 1.322000000000003 | 3.751 | 14.069 | 52.773 | 0.267 | 0.071 |
| 1.324000000000003 | 3.758 | 14.126 | 53.091 | 0.266 | 0.071 |
| 1.326000000000003 | 3.766 | 14.182 | 53.41 | 0.266 | 0.071 |
| 1.328000000000003 | 3.773 | 14.239 | 53.732 | 0.265 | 0.07 |
| 1.330000000000003 | 3.781 | 14.296 | 54.055 | 0.264 | 0.07 |
| 1.332000000000003 | 3.789 | 14.354 | 54.38 | 0.264 | 0.07 |
| 1.334000000000003 | 3.796 | 14.411 | 54.707 | 0.263 | 0.069 |
| 1.336000000000003 | 3.804 | 14.469 | 55.037 | 0.263 | 0.069 |
| 1.338000000000003 | 3.811 | 14.527 | 55.368 | 0.262 | 0.069 |
| 1.340000000000003 | 3.819 | 14.585 | 55.701 | 0.262 | 0.069 |
| 1.342000000000003 | 3.827 | 14.644 | 56.036 | 0.261 | 0.068 |
| 1.344000000000003 | 3.834 | 14.702 | 56.374 | 0.261 | 0.068 |
| 1.346000000000003 | 3.842 | 14.761 | 56.713 | 0.26 | 0.068 |
| 1.348000000000003 | 3.85 | 14.82 | 57.054 | 0.26 | 0.067 |
| 1.350000000000003 | 3.857 | 14.88 | 57.397 | 0.259 | 0.067 |
| 1.352000000000003 | 3.865 | 14.939 | 57.743 | 0.259 | 0.067 |
| 1.354000000000003 | 3.873 | 14.999 | 58.09 | 0.258 | 0.067 |
| 1.356000000000003 | 3.881 | 15.059 | 58.44 | 0.258 | 0.066 |
| 1.358000000000003 | 3.888 | 15.12 | 58.792 | 0.257 | 0.066 |
| 1.360000000000003 | 3.896 | 15.18 | 59.145 | 0.257 | 0.066 |
| 1.362000000000003 | 3.904 | 15.241 | 59.501 | 0.256 | 0.066 |
| 1.364000000000003 | 3.912 | 15.302 | 59.859 | 0.256 | 0.065 |
| 1.366000000000003 | 3.92 | 15.364 | 60.22 | 0.255 | 0.065 |
| 1.368000000000003 | 3.927 | 15.425 | 60.582 | 0.255 | 0.065 |
| 1.370000000000003 | 3.935 | 15.487 | 60.947 | 0.254 | 0.065 |
| 1.372000000000003 | 3.943 | 15.549 | 61.313 | 0.254 | 0.064 |
| 1.374000000000003 | 3.951 | 15.611 | 61.682 | 0.253 | 0.064 |
| 1.376000000000003 | 3.959 | 15.674 | 62.054 | 0.253 | 0.064 |
| 1.378000000000003 | 3.967 | 15.737 | 62.427 | 0.252 | 0.064 |
| 1.380000000000003 | 3.975 | 15.8 | 62.803 | 0.252 | 0.063 |
| 1.382000000000003 | 3.983 | 15.863 | 63.181 | 0.251 | 0.063 |
| 1.384000000000003 | 3.991 | 15.927 | 63.561 | 0.251 | 0.063 |
| 1.386000000000003 | 3.999 | 15.991 | 63.944 | 0.25 | 0.063 |
| 1.388000000000003 | 4.007 | 16.055 | 64.328 | 0.25 | 0.062 |
| 1.390000000000003 | 4.015 | 16.119 | 64.715 | 0.249 | 0.062 |
| 1.392000000000003 | 4.023 | 16.184 | 65.105 | 0.249 | 0.062 |
| 1.394000000000003 | 4.031 | 16.248 | 65.497 | 0.248 | 0.062 |
| 1.396000000000003 | 4.039 | 16.314 | 65.891 | 0.248 | 0.061 |
| 1.398000000000003 | 4.047 | 16.379 | 66.287 | 0.247 | 0.061 |
| 1.400000000000003 | 4.055 | 16.445 | 66.686 | 0.247 | 0.061 |
| 1.402000000000003 | 4.063 | 16.511 | 67.088 | 0.246 | 0.061 |
| 1.404000000000003 | 4.071 | 16.577 | 67.491 | 0.246 | 0.06 |
| 1.406000000000003 | 4.08 | 16.643 | 67.898 | 0.245 | 0.06 |
| 1.408000000000003 | 4.088 | 16.71 | 68.306 | 0.245 | 0.06 |
| 1.410000000000003 | 4.096 | 16.777 | 68.717 | 0.244 | 0.06 |
| 1.412000000000003 | 4.104 | 16.844 | 69.131 | 0.244 | 0.059 |
| 1.414000000000003 | 4.112 | 16.912 | 69.547 | 0.243 | 0.059 |
| 1.416000000000003 | 4.121 | 16.979 | 69.965 | 0.243 | 0.059 |
| 1.418000000000003 | 4.129 | 17.047 | 70.386 | 0.242 | 0.059 |
| 1.420000000000003 | 4.137 | 17.116 | 70.81 | 0.242 | 0.058 |
| 1.422000000000003 | 4.145 | 17.184 | 71.236 | 0.241 | 0.058 |
| 1.424000000000003 | 4.154 | 17.253 | 71.665 | 0.241 | 0.058 |
| 1.426000000000003 | 4.162 | 17.322 | 72.096 | 0.24 | 0.058 |
| 1.428000000000003 | 4.17 | 17.392 | 72.53 | 0.24 | 0.057 |
| 1.430000000000003 | 4.179 | 17.462 | 72.966 | 0.239 | 0.057 |
| 1.432000000000003 | 4.187 | 17.532 | 73.406 | 0.239 | 0.057 |
| 1.434000000000003 | 4.195 | 17.602 | 73.847 | 0.238 | 0.057 |
| 1.436000000000003 | 4.204 | 17.672 | 74.292 | 0.238 | 0.057 |
| 1.438000000000003 | 4.212 | 17.743 | 74.739 | 0.237 | 0.056 |
| 1.440000000000003 | 4.221 | 17.814 | 75.189 | 0.237 | 0.056 |
| 1.442000000000003 | 4.229 | 17.886 | 75.641 | 0.236 | 0.056 |
| 1.444000000000003 | 4.238 | 17.957 | 76.096 | 0.236 | 0.056 |
| 1.446000000000003 | 4.246 | 18.029 | 76.554 | 0.236 | 0.055 |
| 1.448000000000003 | 4.255 | 18.102 | 77.015 | 0.235 | 0.055 |
| 1.450000000000003 | 4.263 | 18.174 | 77.478 | 0.235 | 0.055 |
| 1.452000000000003 | 4.272 | 18.247 | 77.945 | 0.234 | 0.055 |
| 1.454000000000003 | 4.28 | 18.32 | 78.414 | 0.234 | 0.055 |
| 1.456000000000003 | 4.289 | 18.394 | 78.886 | 0.233 | 0.054 |
| 1.458000000000003 | 4.297 | 18.467 | 79.36 | 0.233 | 0.054 |
| 1.460000000000003 | 4.306 | 18.541 | 79.838 | 0.232 | 0.054 |
| 1.462000000000003 | 4.315 | 18.616 | 80.319 | 0.232 | 0.054 |
| 1.464000000000003 | 4.323 | 18.69 | 80.802 | 0.231 | 0.054 |
| 1.466000000000003 | 4.332 | 18.765 | 81.288 | 0.231 | 0.053 |
| 1.468000000000003 | 4.341 | 18.84 | 81.777 | 0.23 | 0.053 |
| 1.470000000000003 | 4.349 | 18.916 | 82.269 | 0.23 | 0.053 |
| 1.472000000000003 | 4.358 | 18.992 | 82.765 | 0.229 | 0.053 |
| 1.474000000000003 | 4.367 | 19.068 | 83.263 | 0.229 | 0.052 |
| 1.476000000000003 | 4.375 | 19.144 | 83.764 | 0.229 | 0.052 |
| 1.478000000000003 | 4.384 | 19.221 | 84.268 | 0.228 | 0.052 |
| 1.480000000000003 | 4.393 | 19.298 | 84.775 | 0.228 | 0.052 |
| 1.482000000000003 | 4.402 | 19.375 | 85.285 | 0.227 | 0.052 |
| 1.484000000000003 | 4.411 | 19.453 | 85.798 | 0.227 | 0.051 |
| 1.486000000000003 | 4.419 | 19.531 | 86.315 | 0.226 | 0.051 |
| 1.488000000000003 | 4.428 | 19.609 | 86.834 | 0.226 | 0.051 |
| 1.490000000000003 | 4.437 | 19.688 | 87.357 | 0.225 | 0.051 |
| 1.492000000000003 | 4.446 | 19.767 | 87.882 | 0.225 | 0.051 |
| 1.494000000000003 | 4.455 | 19.846 | 88.411 | 0.224 | 0.05 |
| 1.496000000000003 | 4.464 | 19.925 | 88.943 | 0.224 | 0.05 |
| 1.498000000000003 | 4.473 | 20.005 | 89.479 | 0.224 | 0.05 |
| 1.500000000000003 | 4.482 | 20.086 | 90.017 | 0.223 | 0.05 |
| 1.502000000000003 | 4.491 | 20.166 | 90.559 | 0.223 | 0.05 |
| 1.504000000000003 | 4.5 | 20.247 | 91.104 | 0.222 | 0.049 |
| 1.506000000000003 | 4.509 | 20.328 | 91.652 | 0.222 | 0.049 |
| 1.508000000000003 | 4.518 | 20.409 | 92.204 | 0.221 | 0.049 |
| 1.510000000000003 | 4.527 | 20.491 | 92.759 | 0.221 | 0.049 |
| 1.512000000000003 | 4.536 | 20.573 | 93.317 | 0.22 | 0.049 |
| 1.514000000000003 | 4.545 | 20.656 | 93.878 | 0.22 | 0.048 |
| 1.516000000000003 | 4.554 | 20.739 | 94.443 | 0.22 | 0.048 |
| 1.518000000000003 | 4.563 | 20.822 | 95.012 | 0.219 | 0.048 |
| 1.520000000000003 | 4.572 | 20.905 | 95.583 | 0.219 | 0.048 |
| 1.522000000000003 | 4.581 | 20.989 | 96.159 | 0.218 | 0.048 |
| 1.524000000000003 | 4.591 | 21.073 | 96.737 | 0.218 | 0.047 |
| 1.526000000000003 | 4.6 | 21.158 | 97.32 | 0.217 | 0.047 |
| 1.528000000000003 | 4.609 | 21.242 | 97.905 | 0.217 | 0.047 |
| 1.530000000000003 | 4.618 | 21.328 | 98.494 | 0.217 | 0.047 |
| 1.532000000000003 | 4.627 | 21.413 | 99.087 | 0.216 | 0.047 |
| 1.534000000000003 | 4.637 | 21.499 | 99.683 | 0.216 | 0.047 |
| 1.536000000000003 | 4.646 | 21.585 | 100.283 | 0.215 | 0.046 |
| 1.538000000000003 | 4.655 | 21.672 | 100.887 | 0.215 | 0.046 |
| 1.540000000000003 | 4.665 | 21.758 | 101.494 | 0.214 | 0.046 |
| 1.542000000000003 | 4.674 | 21.846 | 102.105 | 0.214 | 0.046 |
| 1.544000000000003 | 4.683 | 21.933 | 102.719 | 0.214 | 0.046 |
| 1.546000000000003 | 4.693 | 22.021 | 103.337 | 0.213 | 0.045 |
| 1.548000000000003 | 4.702 | 22.109 | 103.959 | 0.213 | 0.045 |
| 1.550000000000003 | 4.711 | 22.198 | 104.585 | 0.212 | 0.045 |
| 1.552000000000003 | 4.721 | 22.287 | 105.214 | 0.212 | 0.045 |
| 1.554000000000003 | 4.73 | 22.376 | 105.848 | 0.211 | 0.045 |
| 1.556000000000003 | 4.74 | 22.466 | 106.485 | 0.211 | 0.045 |
| 1.558000000000003 | 4.749 | 22.556 | 107.125 | 0.211 | 0.044 |
| 1.560000000000003 | 4.759 | 22.646 | 107.77 | 0.21 | 0.044 |
| 1.562000000000003 | 4.768 | 22.737 | 108.419 | 0.21 | 0.044 |
| 1.564000000000003 | 4.778 | 22.828 | 109.071 | 0.209 | 0.044 |
| 1.566000000000003 | 4.787 | 22.92 | 109.727 | 0.209 | 0.044 |
| 1.568000000000003 | 4.797 | 23.012 | 110.388 | 0.208 | 0.043 |
| 1.570000000000003 | 4.807 | 23.104 | 111.052 | 0.208 | 0.043 |
| 1.572000000000003 | 4.816 | 23.196 | 111.72 | 0.208 | 0.043 |
| 1.574000000000003 | 4.826 | 23.289 | 112.393 | 0.207 | 0.043 |
| 1.576000000000003 | 4.836 | 23.383 | 113.069 | 0.207 | 0.043 |
| 1.578000000000003 | 4.845 | 23.477 | 113.75 | 0.206 | 0.043 |
| 1.580000000000003 | 4.855 | 23.571 | 114.434 | 0.206 | 0.042 |
| 1.582000000000003 | 4.865 | 23.665 | 115.123 | 0.206 | 0.042 |
| 1.584000000000003 | 4.874 | 23.76 | 115.816 | 0.205 | 0.042 |
| 1.586000000000003 | 4.884 | 23.855 | 116.513 | 0.205 | 0.042 |
| 1.588000000000003 | 4.894 | 23.951 | 117.214 | 0.204 | 0.042 |
| 1.590000000000003 | 4.904 | 24.047 | 117.919 | 0.204 | 0.042 |
| 1.592000000000003 | 4.914 | 24.143 | 118.629 | 0.204 | 0.041 |
| 1.594000000000003 | 4.923 | 24.24 | 119.343 | 0.203 | 0.041 |
| 1.596000000000003 | 4.933 | 24.337 | 120.061 | 0.203 | 0.041 |
| 1.598000000000003 | 4.943 | 24.435 | 120.784 | 0.202 | 0.041 |
| 1.600000000000003 | 4.953 | 24.533 | 121.51 | 0.202 | 0.041 |
| 1.602000000000003 | 4.963 | 24.631 | 122.242 | 0.201 | 0.041 |
| 1.604000000000003 | 4.973 | 24.73 | 122.977 | 0.201 | 0.04 |
| 1.606000000000003 | 4.983 | 24.829 | 123.717 | 0.201 | 0.04 |
| 1.608000000000003 | 4.993 | 24.928 | 124.462 | 0.2 | 0.04 |
| 1.610000000000003 | 5.003 | 25.028 | 125.211 | 0.2 | 0.04 |
| 1.612000000000003 | 5.013 | 25.128 | 125.964 | 0.199 | 0.04 |
| 1.614000000000003 | 5.023 | 25.229 | 126.723 | 0.199 | 0.04 |
| 1.616000000000003 | 5.033 | 25.33 | 127.485 | 0.199 | 0.039 |
| 1.618000000000003 | 5.043 | 25.432 | 128.252 | 0.198 | 0.039 |
| 1.620000000000003 | 5.053 | 25.534 | 129.024 | 0.198 | 0.039 |
| 1.622000000000003 | 5.063 | 25.636 | 129.801 | 0.198 | 0.039 |
| 1.624000000000003 | 5.073 | 25.739 | 130.582 | 0.197 | 0.039 |
| 1.626000000000003 | 5.083 | 25.842 | 131.368 | 0.197 | 0.039 |
| 1.628000000000003 | 5.094 | 25.946 | 132.158 | 0.196 | 0.039 |
| 1.630000000000003 | 5.104 | 26.05 | 132.954 | 0.196 | 0.038 |
| 1.632000000000003 | 5.114 | 26.154 | 133.754 | 0.196 | 0.038 |
| 1.634000000000003 | 5.124 | 26.259 | 134.559 | 0.195 | 0.038 |
| 1.636000000000003 | 5.135 | 26.364 | 135.368 | 0.195 | 0.038 |
| 1.638000000000003 | 5.145 | 26.47 | 136.183 | 0.194 | 0.038 |
| 1.640000000000003 | 5.155 | 26.576 | 137.003 | 0.194 | 0.038 |
| 1.642000000000003 | 5.165 | 26.682 | 137.827 | 0.194 | 0.037 |
| 1.644000000000003 | 5.176 | 26.789 | 138.657 | 0.193 | 0.037 |
| 1.646000000000003 | 5.186 | 26.897 | 139.491 | 0.193 | 0.037 |
| 1.648000000000003 | 5.197 | 27.004 | 140.33 | 0.192 | 0.037 |
| 1.650000000000003 | 5.207 | 27.113 | 141.175 | 0.192 | 0.037 |
| 1.652000000000003 | 5.217 | 27.221 | 142.025 | 0.192 | 0.037 |
| 1.654000000000003 | 5.228 | 27.33 | 142.879 | 0.191 | 0.037 |
| 1.656000000000003 | 5.238 | 27.44 | 143.739 | 0.191 | 0.036 |
| 1.658000000000003 | 5.249 | 27.55 | 144.604 | 0.191 | 0.036 |
| 1.660000000000003 | 5.259 | 27.66 | 145.474 | 0.19 | 0.036 |
| 1.662000000000003 | 5.27 | 27.771 | 146.35 | 0.19 | 0.036 |
| 1.664000000000003 | 5.28 | 27.883 | 147.231 | 0.189 | 0.036 |
| 1.666000000000003 | 5.291 | 27.994 | 148.117 | 0.189 | 0.036 |
| 1.668000000000003 | 5.302 | 28.106 | 149.008 | 0.189 | 0.036 |
| 1.670000000000003 | 5.312 | 28.219 | 149.905 | 0.188 | 0.035 |
| 1.672000000000003 | 5.323 | 28.332 | 150.807 | 0.188 | 0.035 |
| 1.674000000000003 | 5.333 | 28.446 | 151.714 | 0.187 | 0.035 |
| 1.676000000000003 | 5.344 | 28.56 | 152.627 | 0.187 | 0.035 |
| 1.678000000000003 | 5.355 | 28.674 | 153.546 | 0.187 | 0.035 |
| 1.680000000000003 | 5.366 | 28.789 | 154.47 | 0.186 | 0.035 |
| 1.682000000000003 | 5.376 | 28.905 | 155.4 | 0.186 | 0.035 |
| 1.684000000000003 | 5.387 | 29.02 | 156.335 | 0.186 | 0.034 |
| 1.686000000000003 | 5.398 | 29.137 | 157.276 | 0.185 | 0.034 |
| 1.688000000000003 | 5.409 | 29.254 | 158.222 | 0.185 | 0.034 |
| 1.690000000000003 | 5.419 | 29.371 | 159.174 | 0.185 | 0.034 |
| 1.692000000000003 | 5.43 | 29.488 | 160.132 | 0.184 | 0.034 |
| 1.694000000000003 | 5.441 | 29.607 | 161.096 | 0.184 | 0.034 |
| 1.696000000000003 | 5.452 | 29.725 | 162.065 | 0.183 | 0.034 |
| 1.698000000000003 | 5.463 | 29.844 | 163.041 | 0.183 | 0.034 |
| 1.700000000000003 | 5.474 | 29.964 | 164.022 | 0.183 | 0.033 |
| 1.702000000000003 | 5.485 | 30.084 | 165.009 | 0.182 | 0.033 |
| 1.704000000000003 | 5.496 | 30.205 | 166.002 | 0.182 | 0.033 |
| 1.706000000000003 | 5.507 | 30.326 | 167.001 | 0.182 | 0.033 |
| 1.708000000000003 | 5.518 | 30.447 | 168.006 | 0.181 | 0.033 |
| 1.710000000000003 | 5.529 | 30.569 | 169.017 | 0.181 | 0.033 |
| 1.712000000000003 | 5.54 | 30.692 | 170.034 | 0.181 | 0.033 |
| 1.714000000000003 | 5.551 | 30.815 | 171.058 | 0.18 | 0.032 |
| 1.716000000000003 | 5.562 | 30.938 | 172.087 | 0.18 | 0.032 |
| 1.718000000000003 | 5.573 | 31.062 | 173.123 | 0.179 | 0.032 |
| 1.720000000000003 | 5.585 | 31.187 | 174.164 | 0.179 | 0.032 |
| 1.722000000000003 | 5.596 | 31.312 | 175.213 | 0.179 | 0.032 |
| 1.724000000000003 | 5.607 | 31.437 | 176.267 | 0.178 | 0.032 |
| 1.726000000000003 | 5.618 | 31.563 | 177.328 | 0.178 | 0.032 |
| 1.728000000000003 | 5.629 | 31.69 | 178.395 | 0.178 | 0.032 |
| 1.730000000000003 | 5.641 | 31.817 | 179.469 | 0.177 | 0.031 |
| 1.732000000000003 | 5.652 | 31.944 | 180.549 | 0.177 | 0.031 |
| 1.734000000000003 | 5.663 | 32.073 | 181.635 | 0.177 | 0.031 |
| 1.736000000000003 | 5.675 | 32.201 | 182.728 | 0.176 | 0.031 |
| 1.738000000000003 | 5.686 | 32.33 | 183.828 | 0.176 | 0.031 |
| 1.740000000000003 | 5.697 | 32.46 | 184.934 | 0.176 | 0.031 |
| 1.742000000000003 | 5.709 | 32.59 | 186.047 | 0.175 | 0.031 |
| 1.744000000000003 | 5.72 | 32.72 | 187.167 | 0.175 | 0.031 |
| 1.746000000000003 | 5.732 | 32.852 | 188.293 | 0.174 | 0.03 |
| 1.748000000000003 | 5.743 | 32.983 | 189.426 | 0.174 | 0.03 |
| 1.750000000000003 | 5.755 | 33.115 | 190.566 | 0.174 | 0.03 |
| 1.752000000000003 | 5.766 | 33.248 | 191.713 | 0.173 | 0.03 |
| 1.754000000000003 | 5.778 | 33.381 | 192.867 | 0.173 | 0.03 |
| 1.756000000000003 | 5.789 | 33.515 | 194.028 | 0.173 | 0.03 |
| 1.758000000000003 | 5.801 | 33.65 | 195.195 | 0.172 | 0.03 |
| 1.760000000000003 | 5.812 | 33.784 | 196.37 | 0.172 | 0.03 |
| 1.762000000000003 | 5.824 | 33.92 | 197.552 | 0.172 | 0.029 |
| 1.764000000000003 | 5.836 | 34.056 | 198.741 | 0.171 | 0.029 |
| 1.766000000000003 | 5.847 | 34.192 | 199.937 | 0.171 | 0.029 |
| 1.768000000000003 | 5.859 | 34.329 | 201.14 | 0.171 | 0.029 |
| 1.770000000000003 | 5.871 | 34.467 | 202.35 | 0.17 | 0.029 |
| 1.772000000000003 | 5.883 | 34.605 | 203.568 | 0.17 | 0.029 |
| 1.774000000000003 | 5.894 | 34.744 | 204.793 | 0.17 | 0.029 |
| 1.776000000000003 | 5.906 | 34.883 | 206.026 | 0.169 | 0.029 |
| 1.778000000000003 | 5.918 | 35.023 | 207.265 | 0.169 | 0.029 |
| 1.780000000000003 | 5.93 | 35.163 | 208.513 | 0.169 | 0.028 |
| 1.782000000000003 | 5.942 | 35.304 | 209.768 | 0.168 | 0.028 |
| 1.784000000000003 | 5.954 | 35.446 | 211.03 | 0.168 | 0.028 |
| 1.786000000000003 | 5.966 | 35.588 | 212.3 | 0.168 | 0.028 |
| 1.788000000000003 | 5.977 | 35.73 | 213.578 | 0.167 | 0.028 |
| 1.790000000000003 | 5.989 | 35.874 | 214.863 | 0.167 | 0.028 |
| 1.792000000000003 | 6.001 | 36.017 | 216.156 | 0.167 | 0.028 |
| 1.794000000000003 | 6.013 | 36.162 | 217.457 | 0.166 | 0.028 |
| 1.796000000000003 | 6.025 | 36.307 | 218.765 | 0.166 | 0.028 |
| 1.798000000000003 | 6.038 | 36.452 | 220.082 | 0.166 | 0.027 |
| 1.800000000000003 | 6.05 | 36.598 | 221.406 | 0.165 | 0.027 |
| 1.802000000000003 | 6.062 | 36.745 | 222.739 | 0.165 | 0.027 |
| 1.804000000000003 | 6.074 | 36.892 | 224.079 | 0.165 | 0.027 |
| 1.806000000000003 | 6.086 | 37.04 | 225.428 | 0.164 | 0.027 |
| 1.808000000000003 | 6.098 | 37.189 | 226.784 | 0.164 | 0.027 |
| 1.810000000000003 | 6.11 | 37.338 | 228.149 | 0.164 | 0.027 |
| 1.812000000000003 | 6.123 | 37.487 | 229.522 | 0.163 | 0.027 |
| 1.814000000000003 | 6.135 | 37.637 | 230.904 | 0.163 | 0.027 |
| 1.816000000000003 | 6.147 | 37.788 | 232.293 | 0.163 | 0.026 |
| 1.818000000000003 | 6.16 | 37.94 | 233.691 | 0.162 | 0.026 |
| 1.820000000000003 | 6.172 | 38.092 | 235.097 | 0.162 | 0.026 |
| 1.822000000000003 | 6.184 | 38.245 | 236.512 | 0.162 | 0.026 |
| 1.824000000000003 | 6.197 | 38.398 | 237.936 | 0.161 | 0.026 |
| 1.826000000000003 | 6.209 | 38.552 | 239.367 | 0.161 | 0.026 |
| 1.828000000000003 | 6.221 | 38.706 | 240.808 | 0.161 | 0.026 |
| 1.830000000000003 | 6.234 | 38.861 | 242.257 | 0.16 | 0.026 |
| 1.832000000000003 | 6.246 | 39.017 | 243.715 | 0.16 | 0.026 |
| 1.834000000000003 | 6.259 | 39.173 | 245.182 | 0.16 | 0.026 |
| 1.836000000000003 | 6.271 | 39.33 | 246.657 | 0.159 | 0.025 |
| 1.838000000000003 | 6.284 | 39.488 | 248.142 | 0.159 | 0.025 |
| 1.840000000000003 | 6.297 | 39.646 | 249.635 | 0.159 | 0.025 |
| 1.842000000000003 | 6.309 | 39.805 | 251.137 | 0.159 | 0.025 |
| 1.844000000000003 | 6.322 | 39.965 | 252.649 | 0.158 | 0.025 |
| 1.846000000000003 | 6.334 | 40.125 | 254.169 | 0.158 | 0.025 |
| 1.848000000000003 | 6.347 | 40.286 | 255.699 | 0.158 | 0.025 |
| 1.850000000000003 | 6.36 | 40.447 | 257.238 | 0.157 | 0.025 |
| 1.852000000000003 | 6.373 | 40.609 | 258.786 | 0.157 | 0.025 |
| 1.854000000000003 | 6.385 | 40.772 | 260.343 | 0.157 | 0.025 |
| 1.856000000000003 | 6.398 | 40.936 | 261.91 | 0.156 | 0.024 |
| 1.858000000000003 | 6.411 | 41.1 | 263.486 | 0.156 | 0.024 |
| 1.860000000000003 | 6.424 | 41.264 | 265.072 | 0.156 | 0.024 |
| 1.862000000000003 | 6.437 | 41.43 | 266.667 | 0.155 | 0.024 |
| 1.864000000000003 | 6.449 | 41.596 | 268.272 | 0.155 | 0.024 |
| 1.866000000000003 | 6.462 | 41.763 | 269.886 | 0.155 | 0.024 |
| 1.868000000000003 | 6.475 | 41.93 | 271.51 | 0.154 | 0.024 |
| 1.870000000000003 | 6.488 | 42.098 | 273.144 | 0.154 | 0.024 |
| 1.872000000000003 | 6.501 | 42.267 | 274.788 | 0.154 | 0.024 |
| 1.874000000000003 | 6.514 | 42.436 | 276.442 | 0.154 | 0.024 |
| 1.876000000000003 | 6.527 | 42.606 | 278.105 | 0.153 | 0.023 |
| 1.878000000000003 | 6.54 | 42.777 | 279.779 | 0.153 | 0.023 |
| 1.880000000000003 | 6.554 | 42.948 | 281.463 | 0.153 | 0.023 |
| 1.882000000000003 | 6.567 | 43.121 | 283.157 | 0.152 | 0.023 |
| 1.884000000000003 | 6.58 | 43.293 | 284.861 | 0.152 | 0.023 |
| 1.886000000000003 | 6.593 | 43.467 | 286.575 | 0.152 | 0.023 |
| 1.888000000000003 | 6.606 | 43.641 | 288.3 | 0.151 | 0.023 |
| 1.890000000000003 | 6.619 | 43.816 | 290.035 | 0.151 | 0.023 |
| 1.892000000000003 | 6.633 | 43.992 | 291.78 | 0.151 | 0.023 |
| 1.894000000000003 | 6.646 | 44.168 | 293.536 | 0.15 | 0.023 |
| 1.896000000000003 | 6.659 | 44.345 | 295.302 | 0.15 | 0.023 |
| 1.898000000000003 | 6.673 | 44.523 | 297.08 | 0.15 | 0.022 |
| 1.900000000000003 | 6.686 | 44.701 | 298.867 | 0.15 | 0.022 |
| 1.902000000000003 | 6.699 | 44.88 | 300.666 | 0.149 | 0.022 |
| 1.904000000000003 | 6.713 | 45.06 | 302.475 | 0.149 | 0.022 |
| 1.906000000000003 | 6.726 | 45.241 | 304.296 | 0.149 | 0.022 |
| 1.908000000000003 | 6.74 | 45.422 | 306.127 | 0.148 | 0.022 |
| 1.910000000000003 | 6.753 | 45.604 | 307.969 | 0.148 | 0.022 |
| 1.912000000000003 | 6.767 | 45.787 | 309.823 | 0.148 | 0.022 |
| 1.914000000000003 | 6.78 | 45.971 | 311.687 | 0.147 | 0.022 |
| 1.916000000000003 | 6.794 | 46.155 | 313.563 | 0.147 | 0.022 |
| 1.918000000000003 | 6.807 | 46.34 | 315.45 | 0.147 | 0.022 |
| 1.920000000000003 | 6.821 | 46.525 | 317.348 | 0.147 | 0.021 |
| 1.922000000000003 | 6.835 | 46.712 | 319.258 | 0.146 | 0.021 |
| 1.924000000000003 | 6.848 | 46.899 | 321.179 | 0.146 | 0.021 |
| 1.926000000000003 | 6.862 | 47.087 | 323.112 | 0.146 | 0.021 |
| 1.928000000000003 | 6.876 | 47.276 | 325.057 | 0.145 | 0.021 |
| 1.930000000000003 | 6.89 | 47.465 | 327.013 | 0.145 | 0.021 |
| 1.932000000000003 | 6.903 | 47.656 | 328.981 | 0.145 | 0.021 |
| 1.934000000000003 | 6.917 | 47.847 | 330.961 | 0.145 | 0.021 |
| 1.936000000000003 | 6.931 | 48.038 | 332.953 | 0.144 | 0.021 |
| 1.938000000000003 | 6.945 | 48.231 | 334.956 | 0.144 | 0.021 |
| 1.940000000000003 | 6.959 | 48.424 | 336.972 | 0.144 | 0.021 |
| 1.942000000000003 | 6.973 | 48.618 | 339 | 0.143 | 0.021 |
| 1.944000000000003 | 6.987 | 48.813 | 341.04 | 0.143 | 0.02 |
| 1.946000000000003 | 7.001 | 49.009 | 343.092 | 0.143 | 0.02 |
| 1.948000000000003 | 7.015 | 49.205 | 345.157 | 0.143 | 0.02 |
| 1.950000000000003 | 7.029 | 49.402 | 347.234 | 0.142 | 0.02 |
| 1.952000000000003 | 7.043 | 49.6 | 349.324 | 0.142 | 0.02 |
| 1.954000000000003 | 7.057 | 49.799 | 351.426 | 0.142 | 0.02 |
| 1.956000000000003 | 7.071 | 49.999 | 353.541 | 0.141 | 0.02 |
| 1.958000000000003 | 7.085 | 50.199 | 355.669 | 0.141 | 0.02 |
| 1.960000000000003 | 7.099 | 50.4 | 357.809 | 0.141 | 0.02 |
| 1.962000000000003 | 7.114 | 50.602 | 359.963 | 0.141 | 0.02 |
| 1.964000000000003 | 7.128 | 50.805 | 362.129 | 0.14 | 0.02 |
| 1.966000000000003 | 7.142 | 51.009 | 364.308 | 0.14 | 0.02 |
| 1.968000000000003 | 7.156 | 51.213 | 366.501 | 0.14 | 0.02 |
| 1.970000000000003 | 7.171 | 51.419 | 368.706 | 0.139 | 0.019 |
| 1.972000000000003 | 7.185 | 51.625 | 370.925 | 0.139 | 0.019 |
| 1.974000000000003 | 7.199 | 51.832 | 373.157 | 0.139 | 0.019 |
| 1.976000000000003 | 7.214 | 52.039 | 375.403 | 0.139 | 0.019 |
| 1.978000000000003 | 7.228 | 52.248 | 377.662 | 0.138 | 0.019 |
| 1.980000000000003 | 7.243 | 52.457 | 379.935 | 0.138 | 0.019 |
| 1.982000000000003 | 7.257 | 52.668 | 382.221 | 0.138 | 0.019 |
| 1.984000000000003 | 7.272 | 52.879 | 384.522 | 0.138 | 0.019 |
| 1.986000000000003 | 7.286 | 53.091 | 386.836 | 0.137 | 0.019 |
| 1.988000000000003 | 7.301 | 53.303 | 389.164 | 0.137 | 0.019 |
| 1.990000000000003 | 7.316 | 53.517 | 391.506 | 0.137 | 0.019 |
| 1.992000000000003 | 7.33 | 53.732 | 393.862 | 0.136 | 0.019 |
| 1.994000000000003 | 7.345 | 53.947 | 396.232 | 0.136 | 0.019 |
| 1.996000000000003 | 7.36 | 54.163 | 398.617 | 0.136 | 0.018 |
| 1.998000000000003 | 7.374 | 54.38 | 401.015 | 0.136 | 0.018 |
| 2.000000000000003 | 7.389 | 54.598 | 403.429 | 0.135 | 0.018 |